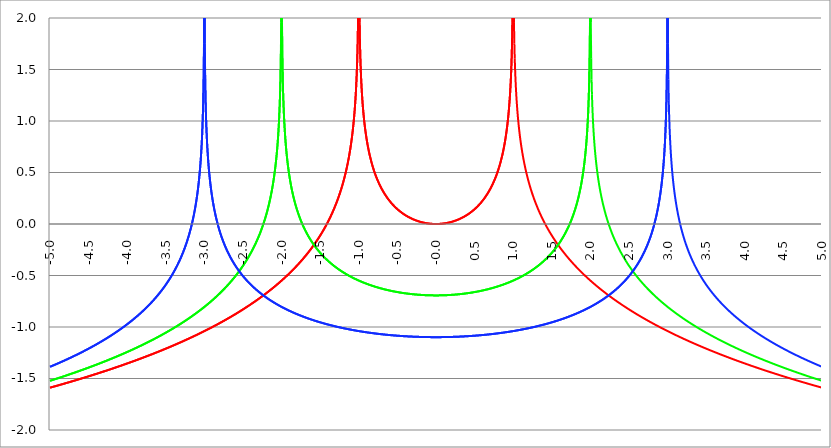
| Category | Series 1 | Series 0 | Series 2 |
|---|---|---|---|
| -5.0 | -1.589 | -1.522 | -1.386 |
| -4.995 | -1.588 | -1.521 | -1.385 |
| -4.99 | -1.587 | -1.52 | -1.383 |
| -4.985 | -1.586 | -1.519 | -1.382 |
| -4.98 | -1.585 | -1.517 | -1.38 |
| -4.975 | -1.584 | -1.516 | -1.378 |
| -4.97 | -1.583 | -1.515 | -1.377 |
| -4.965000000000001 | -1.582 | -1.514 | -1.375 |
| -4.960000000000001 | -1.581 | -1.513 | -1.374 |
| -4.955000000000001 | -1.58 | -1.511 | -1.372 |
| -4.950000000000001 | -1.579 | -1.51 | -1.371 |
| -4.945000000000001 | -1.577 | -1.509 | -1.369 |
| -4.940000000000001 | -1.576 | -1.508 | -1.367 |
| -4.935000000000001 | -1.575 | -1.507 | -1.366 |
| -4.930000000000001 | -1.574 | -1.505 | -1.364 |
| -4.925000000000002 | -1.573 | -1.504 | -1.362 |
| -4.920000000000002 | -1.572 | -1.503 | -1.361 |
| -4.915000000000002 | -1.571 | -1.502 | -1.359 |
| -4.910000000000002 | -1.57 | -1.501 | -1.358 |
| -4.905000000000002 | -1.569 | -1.499 | -1.356 |
| -4.900000000000002 | -1.568 | -1.498 | -1.354 |
| -4.895000000000002 | -1.567 | -1.497 | -1.353 |
| -4.890000000000002 | -1.566 | -1.496 | -1.351 |
| -4.885000000000002 | -1.565 | -1.494 | -1.349 |
| -4.880000000000002 | -1.564 | -1.493 | -1.348 |
| -4.875000000000003 | -1.563 | -1.492 | -1.346 |
| -4.870000000000003 | -1.562 | -1.491 | -1.344 |
| -4.865000000000003 | -1.56 | -1.49 | -1.343 |
| -4.860000000000003 | -1.559 | -1.488 | -1.341 |
| -4.855000000000003 | -1.558 | -1.487 | -1.34 |
| -4.850000000000003 | -1.557 | -1.486 | -1.338 |
| -4.845000000000003 | -1.556 | -1.485 | -1.336 |
| -4.840000000000003 | -1.555 | -1.483 | -1.335 |
| -4.835000000000003 | -1.554 | -1.482 | -1.333 |
| -4.830000000000004 | -1.553 | -1.481 | -1.331 |
| -4.825000000000004 | -1.552 | -1.48 | -1.329 |
| -4.820000000000004 | -1.551 | -1.478 | -1.328 |
| -4.815000000000004 | -1.55 | -1.477 | -1.326 |
| -4.810000000000004 | -1.549 | -1.476 | -1.324 |
| -4.805000000000004 | -1.548 | -1.475 | -1.323 |
| -4.800000000000004 | -1.546 | -1.473 | -1.321 |
| -4.795000000000004 | -1.545 | -1.472 | -1.319 |
| -4.790000000000004 | -1.544 | -1.471 | -1.318 |
| -4.785000000000004 | -1.543 | -1.469 | -1.316 |
| -4.780000000000004 | -1.542 | -1.468 | -1.314 |
| -4.775000000000004 | -1.541 | -1.467 | -1.312 |
| -4.770000000000004 | -1.54 | -1.466 | -1.311 |
| -4.765000000000005 | -1.539 | -1.464 | -1.309 |
| -4.760000000000005 | -1.538 | -1.463 | -1.307 |
| -4.755000000000005 | -1.537 | -1.462 | -1.305 |
| -4.750000000000005 | -1.535 | -1.461 | -1.304 |
| -4.745000000000005 | -1.534 | -1.459 | -1.302 |
| -4.740000000000005 | -1.533 | -1.458 | -1.3 |
| -4.735000000000005 | -1.532 | -1.457 | -1.298 |
| -4.730000000000005 | -1.531 | -1.455 | -1.297 |
| -4.725000000000006 | -1.53 | -1.454 | -1.295 |
| -4.720000000000006 | -1.529 | -1.453 | -1.293 |
| -4.715000000000006 | -1.528 | -1.452 | -1.291 |
| -4.710000000000006 | -1.527 | -1.45 | -1.29 |
| -4.705000000000006 | -1.526 | -1.449 | -1.288 |
| -4.700000000000006 | -1.524 | -1.448 | -1.286 |
| -4.695000000000006 | -1.523 | -1.446 | -1.284 |
| -4.690000000000006 | -1.522 | -1.445 | -1.282 |
| -4.685000000000007 | -1.521 | -1.444 | -1.281 |
| -4.680000000000007 | -1.52 | -1.442 | -1.279 |
| -4.675000000000007 | -1.519 | -1.441 | -1.277 |
| -4.670000000000007 | -1.518 | -1.44 | -1.275 |
| -4.665000000000007 | -1.517 | -1.439 | -1.273 |
| -4.660000000000007 | -1.515 | -1.437 | -1.271 |
| -4.655000000000007 | -1.514 | -1.436 | -1.27 |
| -4.650000000000007 | -1.513 | -1.435 | -1.268 |
| -4.645000000000007 | -1.512 | -1.433 | -1.266 |
| -4.640000000000008 | -1.511 | -1.432 | -1.264 |
| -4.635000000000008 | -1.51 | -1.431 | -1.262 |
| -4.630000000000008 | -1.509 | -1.429 | -1.26 |
| -4.625000000000008 | -1.508 | -1.428 | -1.258 |
| -4.620000000000008 | -1.506 | -1.427 | -1.257 |
| -4.615000000000008 | -1.505 | -1.425 | -1.255 |
| -4.610000000000008 | -1.504 | -1.424 | -1.253 |
| -4.605000000000008 | -1.503 | -1.423 | -1.251 |
| -4.600000000000008 | -1.502 | -1.421 | -1.249 |
| -4.595000000000009 | -1.501 | -1.42 | -1.247 |
| -4.590000000000009 | -1.5 | -1.419 | -1.245 |
| -4.585000000000009 | -1.498 | -1.417 | -1.243 |
| -4.580000000000009 | -1.497 | -1.416 | -1.241 |
| -4.57500000000001 | -1.496 | -1.415 | -1.24 |
| -4.57000000000001 | -1.495 | -1.413 | -1.238 |
| -4.565000000000009 | -1.494 | -1.412 | -1.236 |
| -4.560000000000009 | -1.493 | -1.41 | -1.234 |
| -4.555000000000009 | -1.492 | -1.409 | -1.232 |
| -4.55000000000001 | -1.49 | -1.408 | -1.23 |
| -4.54500000000001 | -1.489 | -1.406 | -1.228 |
| -4.54000000000001 | -1.488 | -1.405 | -1.226 |
| -4.53500000000001 | -1.487 | -1.404 | -1.224 |
| -4.53000000000001 | -1.486 | -1.402 | -1.222 |
| -4.52500000000001 | -1.485 | -1.401 | -1.22 |
| -4.52000000000001 | -1.483 | -1.4 | -1.218 |
| -4.51500000000001 | -1.482 | -1.398 | -1.216 |
| -4.51000000000001 | -1.481 | -1.397 | -1.214 |
| -4.505000000000011 | -1.48 | -1.395 | -1.212 |
| -4.500000000000011 | -1.479 | -1.394 | -1.21 |
| -4.495000000000011 | -1.478 | -1.393 | -1.208 |
| -4.490000000000011 | -1.476 | -1.391 | -1.206 |
| -4.485000000000011 | -1.475 | -1.39 | -1.204 |
| -4.480000000000011 | -1.474 | -1.388 | -1.202 |
| -4.475000000000011 | -1.473 | -1.387 | -1.2 |
| -4.470000000000011 | -1.472 | -1.386 | -1.198 |
| -4.465000000000011 | -1.471 | -1.384 | -1.196 |
| -4.460000000000011 | -1.469 | -1.383 | -1.194 |
| -4.455000000000012 | -1.468 | -1.381 | -1.192 |
| -4.450000000000012 | -1.467 | -1.38 | -1.19 |
| -4.445000000000012 | -1.466 | -1.379 | -1.188 |
| -4.440000000000012 | -1.465 | -1.377 | -1.186 |
| -4.435000000000012 | -1.463 | -1.376 | -1.184 |
| -4.430000000000012 | -1.462 | -1.374 | -1.182 |
| -4.425000000000012 | -1.461 | -1.373 | -1.18 |
| -4.420000000000012 | -1.46 | -1.372 | -1.177 |
| -4.415000000000012 | -1.459 | -1.37 | -1.175 |
| -4.410000000000013 | -1.457 | -1.369 | -1.173 |
| -4.405000000000013 | -1.456 | -1.367 | -1.171 |
| -4.400000000000013 | -1.455 | -1.366 | -1.169 |
| -4.395000000000013 | -1.454 | -1.364 | -1.167 |
| -4.390000000000013 | -1.453 | -1.363 | -1.165 |
| -4.385000000000013 | -1.451 | -1.362 | -1.163 |
| -4.380000000000013 | -1.45 | -1.36 | -1.16 |
| -4.375000000000013 | -1.449 | -1.359 | -1.158 |
| -4.370000000000013 | -1.448 | -1.357 | -1.156 |
| -4.365000000000013 | -1.447 | -1.356 | -1.154 |
| -4.360000000000014 | -1.445 | -1.354 | -1.152 |
| -4.355000000000014 | -1.444 | -1.353 | -1.15 |
| -4.350000000000014 | -1.443 | -1.351 | -1.147 |
| -4.345000000000014 | -1.442 | -1.35 | -1.145 |
| -4.340000000000014 | -1.441 | -1.349 | -1.143 |
| -4.335000000000014 | -1.439 | -1.347 | -1.141 |
| -4.330000000000014 | -1.438 | -1.346 | -1.139 |
| -4.325000000000014 | -1.437 | -1.344 | -1.136 |
| -4.320000000000014 | -1.436 | -1.343 | -1.134 |
| -4.315000000000015 | -1.434 | -1.341 | -1.132 |
| -4.310000000000015 | -1.433 | -1.34 | -1.13 |
| -4.305000000000015 | -1.432 | -1.338 | -1.127 |
| -4.300000000000015 | -1.431 | -1.337 | -1.125 |
| -4.295000000000015 | -1.43 | -1.335 | -1.123 |
| -4.290000000000015 | -1.428 | -1.334 | -1.121 |
| -4.285000000000015 | -1.427 | -1.332 | -1.118 |
| -4.280000000000015 | -1.426 | -1.331 | -1.116 |
| -4.275000000000015 | -1.425 | -1.329 | -1.114 |
| -4.270000000000015 | -1.423 | -1.328 | -1.111 |
| -4.265000000000016 | -1.422 | -1.326 | -1.109 |
| -4.260000000000016 | -1.421 | -1.325 | -1.107 |
| -4.255000000000016 | -1.42 | -1.323 | -1.104 |
| -4.250000000000016 | -1.418 | -1.322 | -1.102 |
| -4.245000000000016 | -1.417 | -1.32 | -1.1 |
| -4.240000000000016 | -1.416 | -1.319 | -1.097 |
| -4.235000000000016 | -1.415 | -1.317 | -1.095 |
| -4.230000000000016 | -1.413 | -1.316 | -1.093 |
| -4.225000000000017 | -1.412 | -1.314 | -1.09 |
| -4.220000000000017 | -1.411 | -1.313 | -1.088 |
| -4.215000000000017 | -1.41 | -1.311 | -1.085 |
| -4.210000000000017 | -1.408 | -1.31 | -1.083 |
| -4.205000000000017 | -1.407 | -1.308 | -1.081 |
| -4.200000000000017 | -1.406 | -1.307 | -1.078 |
| -4.195000000000017 | -1.405 | -1.305 | -1.076 |
| -4.190000000000017 | -1.403 | -1.303 | -1.073 |
| -4.185000000000017 | -1.402 | -1.302 | -1.071 |
| -4.180000000000017 | -1.401 | -1.3 | -1.068 |
| -4.175000000000018 | -1.4 | -1.299 | -1.066 |
| -4.170000000000018 | -1.398 | -1.297 | -1.063 |
| -4.165000000000018 | -1.397 | -1.296 | -1.061 |
| -4.160000000000018 | -1.396 | -1.294 | -1.058 |
| -4.155000000000018 | -1.394 | -1.293 | -1.056 |
| -4.150000000000018 | -1.393 | -1.291 | -1.053 |
| -4.145000000000018 | -1.392 | -1.289 | -1.051 |
| -4.140000000000018 | -1.391 | -1.288 | -1.048 |
| -4.135000000000018 | -1.389 | -1.286 | -1.046 |
| -4.130000000000019 | -1.388 | -1.285 | -1.043 |
| -4.125000000000019 | -1.387 | -1.283 | -1.041 |
| -4.120000000000019 | -1.385 | -1.281 | -1.038 |
| -4.115000000000019 | -1.384 | -1.28 | -1.036 |
| -4.110000000000019 | -1.383 | -1.278 | -1.033 |
| -4.105000000000019 | -1.382 | -1.277 | -1.03 |
| -4.100000000000019 | -1.38 | -1.275 | -1.028 |
| -4.095000000000019 | -1.379 | -1.274 | -1.025 |
| -4.090000000000019 | -1.378 | -1.272 | -1.022 |
| -4.085000000000019 | -1.376 | -1.27 | -1.02 |
| -4.08000000000002 | -1.375 | -1.269 | -1.017 |
| -4.07500000000002 | -1.374 | -1.267 | -1.014 |
| -4.07000000000002 | -1.373 | -1.265 | -1.012 |
| -4.06500000000002 | -1.371 | -1.264 | -1.009 |
| -4.06000000000002 | -1.37 | -1.262 | -1.006 |
| -4.05500000000002 | -1.369 | -1.261 | -1.004 |
| -4.05000000000002 | -1.367 | -1.259 | -1.001 |
| -4.04500000000002 | -1.366 | -1.257 | -0.998 |
| -4.04000000000002 | -1.365 | -1.256 | -0.995 |
| -4.03500000000002 | -1.363 | -1.254 | -0.993 |
| -4.03000000000002 | -1.362 | -1.252 | -0.99 |
| -4.025000000000021 | -1.361 | -1.251 | -0.987 |
| -4.020000000000021 | -1.359 | -1.249 | -0.984 |
| -4.015000000000021 | -1.358 | -1.247 | -0.981 |
| -4.010000000000021 | -1.357 | -1.246 | -0.979 |
| -4.005000000000021 | -1.355 | -1.244 | -0.976 |
| -4.000000000000021 | -1.354 | -1.242 | -0.973 |
| -3.995000000000021 | -1.353 | -1.241 | -0.97 |
| -3.990000000000021 | -1.351 | -1.239 | -0.967 |
| -3.985000000000022 | -1.35 | -1.237 | -0.964 |
| -3.980000000000022 | -1.349 | -1.236 | -0.961 |
| -3.975000000000022 | -1.347 | -1.234 | -0.959 |
| -3.970000000000022 | -1.346 | -1.232 | -0.956 |
| -3.965000000000022 | -1.345 | -1.231 | -0.953 |
| -3.960000000000022 | -1.343 | -1.229 | -0.95 |
| -3.955000000000022 | -1.342 | -1.227 | -0.947 |
| -3.950000000000022 | -1.341 | -1.226 | -0.944 |
| -3.945000000000022 | -1.339 | -1.224 | -0.941 |
| -3.940000000000023 | -1.338 | -1.222 | -0.938 |
| -3.935000000000023 | -1.337 | -1.22 | -0.935 |
| -3.930000000000023 | -1.335 | -1.219 | -0.932 |
| -3.925000000000023 | -1.334 | -1.217 | -0.929 |
| -3.920000000000023 | -1.332 | -1.215 | -0.926 |
| -3.915000000000023 | -1.331 | -1.214 | -0.922 |
| -3.910000000000023 | -1.33 | -1.212 | -0.919 |
| -3.905000000000023 | -1.328 | -1.21 | -0.916 |
| -3.900000000000023 | -1.327 | -1.208 | -0.913 |
| -3.895000000000023 | -1.326 | -1.207 | -0.91 |
| -3.890000000000024 | -1.324 | -1.205 | -0.907 |
| -3.885000000000024 | -1.323 | -1.203 | -0.904 |
| -3.880000000000024 | -1.321 | -1.201 | -0.9 |
| -3.875000000000024 | -1.32 | -1.2 | -0.897 |
| -3.870000000000024 | -1.319 | -1.198 | -0.894 |
| -3.865000000000024 | -1.317 | -1.196 | -0.891 |
| -3.860000000000024 | -1.316 | -1.194 | -0.887 |
| -3.855000000000024 | -1.315 | -1.193 | -0.884 |
| -3.850000000000024 | -1.313 | -1.191 | -0.881 |
| -3.845000000000025 | -1.312 | -1.189 | -0.878 |
| -3.840000000000025 | -1.31 | -1.187 | -0.874 |
| -3.835000000000025 | -1.309 | -1.185 | -0.871 |
| -3.830000000000025 | -1.308 | -1.184 | -0.867 |
| -3.825000000000025 | -1.306 | -1.182 | -0.864 |
| -3.820000000000025 | -1.305 | -1.18 | -0.861 |
| -3.815000000000025 | -1.303 | -1.178 | -0.857 |
| -3.810000000000025 | -1.302 | -1.176 | -0.854 |
| -3.805000000000025 | -1.301 | -1.175 | -0.85 |
| -3.800000000000026 | -1.299 | -1.173 | -0.847 |
| -3.795000000000026 | -1.298 | -1.171 | -0.843 |
| -3.790000000000026 | -1.296 | -1.169 | -0.84 |
| -3.785000000000026 | -1.295 | -1.167 | -0.836 |
| -3.780000000000026 | -1.293 | -1.166 | -0.833 |
| -3.775000000000026 | -1.292 | -1.164 | -0.829 |
| -3.770000000000026 | -1.291 | -1.162 | -0.826 |
| -3.765000000000026 | -1.289 | -1.16 | -0.822 |
| -3.760000000000026 | -1.288 | -1.158 | -0.818 |
| -3.755000000000026 | -1.286 | -1.156 | -0.815 |
| -3.750000000000027 | -1.285 | -1.154 | -0.811 |
| -3.745000000000027 | -1.283 | -1.153 | -0.807 |
| -3.740000000000027 | -1.282 | -1.151 | -0.803 |
| -3.735000000000027 | -1.281 | -1.149 | -0.8 |
| -3.730000000000027 | -1.279 | -1.147 | -0.796 |
| -3.725000000000027 | -1.278 | -1.145 | -0.792 |
| -3.720000000000027 | -1.276 | -1.143 | -0.788 |
| -3.715000000000027 | -1.275 | -1.141 | -0.784 |
| -3.710000000000027 | -1.273 | -1.139 | -0.781 |
| -3.705000000000028 | -1.272 | -1.137 | -0.777 |
| -3.700000000000028 | -1.27 | -1.136 | -0.773 |
| -3.695000000000028 | -1.269 | -1.134 | -0.769 |
| -3.690000000000028 | -1.267 | -1.132 | -0.765 |
| -3.685000000000028 | -1.266 | -1.13 | -0.761 |
| -3.680000000000028 | -1.265 | -1.128 | -0.757 |
| -3.675000000000028 | -1.263 | -1.126 | -0.753 |
| -3.670000000000028 | -1.262 | -1.124 | -0.749 |
| -3.665000000000028 | -1.26 | -1.122 | -0.744 |
| -3.660000000000028 | -1.259 | -1.12 | -0.74 |
| -3.655000000000029 | -1.257 | -1.118 | -0.736 |
| -3.650000000000029 | -1.256 | -1.116 | -0.732 |
| -3.645000000000029 | -1.254 | -1.114 | -0.728 |
| -3.640000000000029 | -1.253 | -1.112 | -0.723 |
| -3.635000000000029 | -1.251 | -1.11 | -0.719 |
| -3.630000000000029 | -1.25 | -1.108 | -0.715 |
| -3.625000000000029 | -1.248 | -1.106 | -0.71 |
| -3.620000000000029 | -1.247 | -1.104 | -0.706 |
| -3.615000000000029 | -1.245 | -1.102 | -0.702 |
| -3.61000000000003 | -1.244 | -1.1 | -0.697 |
| -3.60500000000003 | -1.242 | -1.098 | -0.693 |
| -3.60000000000003 | -1.241 | -1.096 | -0.688 |
| -3.59500000000003 | -1.239 | -1.094 | -0.684 |
| -3.59000000000003 | -1.238 | -1.092 | -0.679 |
| -3.58500000000003 | -1.236 | -1.09 | -0.674 |
| -3.58000000000003 | -1.235 | -1.088 | -0.67 |
| -3.57500000000003 | -1.233 | -1.086 | -0.665 |
| -3.57000000000003 | -1.232 | -1.084 | -0.66 |
| -3.565000000000031 | -1.23 | -1.082 | -0.655 |
| -3.560000000000031 | -1.229 | -1.08 | -0.651 |
| -3.555000000000031 | -1.227 | -1.078 | -0.646 |
| -3.550000000000031 | -1.226 | -1.076 | -0.641 |
| -3.545000000000031 | -1.224 | -1.074 | -0.636 |
| -3.540000000000031 | -1.223 | -1.072 | -0.631 |
| -3.535000000000031 | -1.221 | -1.07 | -0.626 |
| -3.530000000000031 | -1.219 | -1.068 | -0.621 |
| -3.525000000000031 | -1.218 | -1.066 | -0.616 |
| -3.520000000000032 | -1.216 | -1.064 | -0.61 |
| -3.515000000000032 | -1.215 | -1.061 | -0.605 |
| -3.510000000000032 | -1.213 | -1.059 | -0.6 |
| -3.505000000000032 | -1.212 | -1.057 | -0.595 |
| -3.500000000000032 | -1.21 | -1.055 | -0.589 |
| -3.495000000000032 | -1.209 | -1.053 | -0.584 |
| -3.490000000000032 | -1.207 | -1.051 | -0.578 |
| -3.485000000000032 | -1.206 | -1.049 | -0.573 |
| -3.480000000000032 | -1.204 | -1.047 | -0.567 |
| -3.475000000000032 | -1.202 | -1.044 | -0.562 |
| -3.470000000000033 | -1.201 | -1.042 | -0.556 |
| -3.465000000000033 | -1.199 | -1.04 | -0.55 |
| -3.460000000000033 | -1.198 | -1.038 | -0.545 |
| -3.455000000000033 | -1.196 | -1.036 | -0.539 |
| -3.450000000000033 | -1.194 | -1.034 | -0.533 |
| -3.445000000000033 | -1.193 | -1.031 | -0.527 |
| -3.440000000000033 | -1.191 | -1.029 | -0.521 |
| -3.435000000000033 | -1.19 | -1.027 | -0.515 |
| -3.430000000000033 | -1.188 | -1.025 | -0.509 |
| -3.425000000000034 | -1.187 | -1.023 | -0.502 |
| -3.420000000000034 | -1.185 | -1.02 | -0.496 |
| -3.415000000000034 | -1.183 | -1.018 | -0.49 |
| -3.410000000000034 | -1.182 | -1.016 | -0.483 |
| -3.405000000000034 | -1.18 | -1.014 | -0.477 |
| -3.400000000000034 | -1.179 | -1.011 | -0.47 |
| -3.395000000000034 | -1.177 | -1.009 | -0.463 |
| -3.390000000000034 | -1.175 | -1.007 | -0.457 |
| -3.385000000000034 | -1.174 | -1.005 | -0.45 |
| -3.380000000000034 | -1.172 | -1.002 | -0.443 |
| -3.375000000000035 | -1.17 | -1 | -0.436 |
| -3.370000000000035 | -1.169 | -0.998 | -0.429 |
| -3.365000000000035 | -1.167 | -0.996 | -0.421 |
| -3.360000000000035 | -1.166 | -0.993 | -0.414 |
| -3.355000000000035 | -1.164 | -0.991 | -0.407 |
| -3.350000000000035 | -1.162 | -0.989 | -0.399 |
| -3.345000000000035 | -1.161 | -0.986 | -0.392 |
| -3.340000000000035 | -1.159 | -0.984 | -0.384 |
| -3.335000000000035 | -1.157 | -0.982 | -0.376 |
| -3.330000000000036 | -1.156 | -0.979 | -0.368 |
| -3.325000000000036 | -1.154 | -0.977 | -0.36 |
| -3.320000000000036 | -1.152 | -0.975 | -0.352 |
| -3.315000000000036 | -1.151 | -0.972 | -0.344 |
| -3.310000000000036 | -1.149 | -0.97 | -0.335 |
| -3.305000000000036 | -1.147 | -0.967 | -0.327 |
| -3.300000000000036 | -1.146 | -0.965 | -0.318 |
| -3.295000000000036 | -1.144 | -0.963 | -0.309 |
| -3.290000000000036 | -1.142 | -0.96 | -0.301 |
| -3.285000000000036 | -1.141 | -0.958 | -0.291 |
| -3.280000000000036 | -1.139 | -0.955 | -0.282 |
| -3.275000000000037 | -1.137 | -0.953 | -0.273 |
| -3.270000000000037 | -1.136 | -0.951 | -0.263 |
| -3.265000000000037 | -1.134 | -0.948 | -0.253 |
| -3.260000000000037 | -1.132 | -0.946 | -0.244 |
| -3.255000000000037 | -1.131 | -0.943 | -0.233 |
| -3.250000000000037 | -1.129 | -0.941 | -0.223 |
| -3.245000000000037 | -1.127 | -0.938 | -0.213 |
| -3.240000000000037 | -1.126 | -0.936 | -0.202 |
| -3.235000000000038 | -1.124 | -0.933 | -0.191 |
| -3.230000000000038 | -1.122 | -0.931 | -0.18 |
| -3.225000000000038 | -1.12 | -0.928 | -0.168 |
| -3.220000000000038 | -1.119 | -0.926 | -0.157 |
| -3.215000000000038 | -1.117 | -0.923 | -0.145 |
| -3.210000000000038 | -1.115 | -0.921 | -0.133 |
| -3.205000000000038 | -1.114 | -0.918 | -0.12 |
| -3.200000000000038 | -1.112 | -0.915 | -0.108 |
| -3.195000000000038 | -1.11 | -0.913 | -0.094 |
| -3.190000000000039 | -1.108 | -0.91 | -0.081 |
| -3.185000000000039 | -1.107 | -0.908 | -0.067 |
| -3.180000000000039 | -1.105 | -0.905 | -0.053 |
| -3.175000000000039 | -1.103 | -0.903 | -0.039 |
| -3.170000000000039 | -1.101 | -0.9 | -0.024 |
| -3.16500000000004 | -1.1 | -0.897 | -0.009 |
| -3.16000000000004 | -1.098 | -0.895 | 0.007 |
| -3.155000000000039 | -1.096 | -0.892 | 0.024 |
| -3.150000000000039 | -1.094 | -0.889 | 0.04 |
| -3.14500000000004 | -1.093 | -0.887 | 0.058 |
| -3.14000000000004 | -1.091 | -0.884 | 0.076 |
| -3.13500000000004 | -1.089 | -0.881 | 0.094 |
| -3.13000000000004 | -1.087 | -0.879 | 0.114 |
| -3.12500000000004 | -1.085 | -0.876 | 0.134 |
| -3.12000000000004 | -1.084 | -0.873 | 0.154 |
| -3.11500000000004 | -1.082 | -0.871 | 0.176 |
| -3.11000000000004 | -1.08 | -0.868 | 0.199 |
| -3.10500000000004 | -1.078 | -0.865 | 0.222 |
| -3.10000000000004 | -1.076 | -0.862 | 0.247 |
| -3.095000000000041 | -1.075 | -0.86 | 0.273 |
| -3.090000000000041 | -1.073 | -0.857 | 0.301 |
| -3.085000000000041 | -1.071 | -0.854 | 0.33 |
| -3.080000000000041 | -1.069 | -0.851 | 0.36 |
| -3.075000000000041 | -1.067 | -0.848 | 0.393 |
| -3.070000000000041 | -1.066 | -0.845 | 0.428 |
| -3.065000000000041 | -1.064 | -0.843 | 0.465 |
| -3.060000000000041 | -1.062 | -0.84 | 0.506 |
| -3.055000000000041 | -1.06 | -0.837 | 0.55 |
| -3.050000000000042 | -1.058 | -0.834 | 0.598 |
| -3.045000000000042 | -1.056 | -0.831 | 0.651 |
| -3.040000000000042 | -1.055 | -0.828 | 0.71 |
| -3.035000000000042 | -1.053 | -0.825 | 0.777 |
| -3.030000000000042 | -1.051 | -0.822 | 0.855 |
| -3.025000000000042 | -1.049 | -0.82 | 0.946 |
| -3.020000000000042 | -1.047 | -0.817 | 1.058 |
| -3.015000000000042 | -1.045 | -0.814 | 1.203 |
| -3.010000000000042 | -1.043 | -0.811 | 1.406 |
| -3.005000000000043 | -1.042 | -0.808 | 1.753 |
| -3.000000000000043 | -1.04 | -0.805 | 14.497 |
| -2.995000000000043 | -1.038 | -0.802 | 1.754 |
| -2.990000000000043 | -1.036 | -0.799 | 1.408 |
| -2.985000000000043 | -1.034 | -0.796 | 1.205 |
| -2.980000000000043 | -1.032 | -0.793 | 1.062 |
| -2.975000000000043 | -1.03 | -0.79 | 0.951 |
| -2.970000000000043 | -1.028 | -0.786 | 0.86 |
| -2.965000000000043 | -1.026 | -0.783 | 0.783 |
| -2.960000000000043 | -1.025 | -0.78 | 0.717 |
| -2.955000000000044 | -1.023 | -0.777 | 0.658 |
| -2.950000000000044 | -1.021 | -0.774 | 0.606 |
| -2.945000000000044 | -1.019 | -0.771 | 0.559 |
| -2.940000000000044 | -1.017 | -0.768 | 0.516 |
| -2.935000000000044 | -1.015 | -0.765 | 0.476 |
| -2.930000000000044 | -1.013 | -0.761 | 0.44 |
| -2.925000000000044 | -1.011 | -0.758 | 0.406 |
| -2.920000000000044 | -1.009 | -0.755 | 0.374 |
| -2.915000000000044 | -1.007 | -0.752 | 0.344 |
| -2.910000000000045 | -1.005 | -0.748 | 0.316 |
| -2.905000000000045 | -1.003 | -0.745 | 0.289 |
| -2.900000000000045 | -1.001 | -0.742 | 0.264 |
| -2.895000000000045 | -0.999 | -0.739 | 0.24 |
| -2.890000000000045 | -0.997 | -0.735 | 0.217 |
| -2.885000000000045 | -0.996 | -0.732 | 0.195 |
| -2.880000000000045 | -0.994 | -0.729 | 0.174 |
| -2.875000000000045 | -0.992 | -0.725 | 0.154 |
| -2.870000000000045 | -0.99 | -0.722 | 0.135 |
| -2.865000000000045 | -0.988 | -0.719 | 0.117 |
| -2.860000000000046 | -0.986 | -0.715 | 0.099 |
| -2.855000000000046 | -0.984 | -0.712 | 0.082 |
| -2.850000000000046 | -0.982 | -0.708 | 0.065 |
| -2.845000000000046 | -0.98 | -0.705 | 0.049 |
| -2.840000000000046 | -0.978 | -0.701 | 0.034 |
| -2.835000000000046 | -0.976 | -0.698 | 0.019 |
| -2.830000000000046 | -0.974 | -0.694 | 0.004 |
| -2.825000000000046 | -0.972 | -0.691 | -0.01 |
| -2.820000000000046 | -0.97 | -0.687 | -0.023 |
| -2.815000000000047 | -0.968 | -0.684 | -0.037 |
| -2.810000000000047 | -0.965 | -0.68 | -0.049 |
| -2.805000000000047 | -0.963 | -0.676 | -0.062 |
| -2.800000000000047 | -0.961 | -0.673 | -0.074 |
| -2.795000000000047 | -0.959 | -0.669 | -0.086 |
| -2.790000000000047 | -0.957 | -0.665 | -0.098 |
| -2.785000000000047 | -0.955 | -0.662 | -0.109 |
| -2.780000000000047 | -0.953 | -0.658 | -0.12 |
| -2.775000000000047 | -0.951 | -0.654 | -0.131 |
| -2.770000000000047 | -0.949 | -0.65 | -0.141 |
| -2.765000000000048 | -0.947 | -0.647 | -0.152 |
| -2.760000000000048 | -0.945 | -0.643 | -0.162 |
| -2.755000000000048 | -0.943 | -0.639 | -0.172 |
| -2.750000000000048 | -0.941 | -0.635 | -0.181 |
| -2.745000000000048 | -0.939 | -0.631 | -0.191 |
| -2.740000000000048 | -0.936 | -0.627 | -0.2 |
| -2.735000000000048 | -0.934 | -0.624 | -0.209 |
| -2.730000000000048 | -0.932 | -0.62 | -0.218 |
| -2.725000000000048 | -0.93 | -0.616 | -0.227 |
| -2.720000000000049 | -0.928 | -0.612 | -0.236 |
| -2.715000000000049 | -0.926 | -0.608 | -0.244 |
| -2.710000000000049 | -0.924 | -0.604 | -0.252 |
| -2.705000000000049 | -0.922 | -0.6 | -0.26 |
| -2.700000000000049 | -0.919 | -0.595 | -0.268 |
| -2.695000000000049 | -0.917 | -0.591 | -0.276 |
| -2.690000000000049 | -0.915 | -0.587 | -0.284 |
| -2.685000000000049 | -0.913 | -0.583 | -0.291 |
| -2.680000000000049 | -0.911 | -0.579 | -0.299 |
| -2.675000000000049 | -0.909 | -0.575 | -0.306 |
| -2.67000000000005 | -0.907 | -0.57 | -0.313 |
| -2.66500000000005 | -0.904 | -0.566 | -0.32 |
| -2.66000000000005 | -0.902 | -0.562 | -0.327 |
| -2.65500000000005 | -0.9 | -0.557 | -0.334 |
| -2.65000000000005 | -0.898 | -0.553 | -0.341 |
| -2.64500000000005 | -0.896 | -0.549 | -0.348 |
| -2.64000000000005 | -0.893 | -0.544 | -0.354 |
| -2.63500000000005 | -0.891 | -0.54 | -0.361 |
| -2.63000000000005 | -0.889 | -0.535 | -0.367 |
| -2.625000000000051 | -0.887 | -0.531 | -0.373 |
| -2.620000000000051 | -0.884 | -0.526 | -0.379 |
| -2.615000000000051 | -0.882 | -0.522 | -0.385 |
| -2.610000000000051 | -0.88 | -0.517 | -0.391 |
| -2.605000000000051 | -0.878 | -0.512 | -0.397 |
| -2.600000000000051 | -0.875 | -0.508 | -0.403 |
| -2.595000000000051 | -0.873 | -0.503 | -0.409 |
| -2.590000000000051 | -0.871 | -0.498 | -0.415 |
| -2.585000000000051 | -0.869 | -0.493 | -0.42 |
| -2.580000000000052 | -0.866 | -0.488 | -0.426 |
| -2.575000000000052 | -0.864 | -0.484 | -0.431 |
| -2.570000000000052 | -0.862 | -0.479 | -0.437 |
| -2.565000000000052 | -0.86 | -0.474 | -0.442 |
| -2.560000000000052 | -0.857 | -0.469 | -0.447 |
| -2.555000000000052 | -0.855 | -0.464 | -0.453 |
| -2.550000000000052 | -0.853 | -0.459 | -0.458 |
| -2.545000000000052 | -0.85 | -0.454 | -0.463 |
| -2.540000000000052 | -0.848 | -0.448 | -0.468 |
| -2.535000000000053 | -0.846 | -0.443 | -0.473 |
| -2.530000000000053 | -0.843 | -0.438 | -0.478 |
| -2.525000000000053 | -0.841 | -0.433 | -0.482 |
| -2.520000000000053 | -0.839 | -0.427 | -0.487 |
| -2.515000000000053 | -0.836 | -0.422 | -0.492 |
| -2.510000000000053 | -0.834 | -0.416 | -0.497 |
| -2.505000000000053 | -0.831 | -0.411 | -0.501 |
| -2.500000000000053 | -0.829 | -0.405 | -0.506 |
| -2.495000000000053 | -0.827 | -0.4 | -0.51 |
| -2.490000000000053 | -0.824 | -0.394 | -0.515 |
| -2.485000000000054 | -0.822 | -0.389 | -0.519 |
| -2.480000000000054 | -0.82 | -0.383 | -0.524 |
| -2.475000000000054 | -0.817 | -0.377 | -0.528 |
| -2.470000000000054 | -0.815 | -0.371 | -0.532 |
| -2.465000000000054 | -0.812 | -0.365 | -0.536 |
| -2.460000000000054 | -0.81 | -0.359 | -0.541 |
| -2.455000000000054 | -0.807 | -0.353 | -0.545 |
| -2.450000000000054 | -0.805 | -0.347 | -0.549 |
| -2.445000000000054 | -0.803 | -0.341 | -0.553 |
| -2.440000000000055 | -0.8 | -0.335 | -0.557 |
| -2.435000000000055 | -0.798 | -0.329 | -0.561 |
| -2.430000000000055 | -0.795 | -0.322 | -0.565 |
| -2.425000000000055 | -0.793 | -0.316 | -0.569 |
| -2.420000000000055 | -0.79 | -0.309 | -0.573 |
| -2.415000000000055 | -0.788 | -0.303 | -0.577 |
| -2.410000000000055 | -0.785 | -0.296 | -0.58 |
| -2.405000000000055 | -0.783 | -0.289 | -0.584 |
| -2.400000000000055 | -0.78 | -0.283 | -0.588 |
| -2.395000000000055 | -0.778 | -0.276 | -0.591 |
| -2.390000000000056 | -0.775 | -0.269 | -0.595 |
| -2.385000000000056 | -0.773 | -0.262 | -0.599 |
| -2.380000000000056 | -0.77 | -0.255 | -0.602 |
| -2.375000000000056 | -0.767 | -0.248 | -0.606 |
| -2.370000000000056 | -0.765 | -0.24 | -0.609 |
| -2.365000000000056 | -0.762 | -0.233 | -0.613 |
| -2.360000000000056 | -0.76 | -0.225 | -0.616 |
| -2.355000000000056 | -0.757 | -0.218 | -0.62 |
| -2.350000000000056 | -0.755 | -0.21 | -0.623 |
| -2.345000000000057 | -0.752 | -0.202 | -0.627 |
| -2.340000000000057 | -0.749 | -0.195 | -0.63 |
| -2.335000000000057 | -0.747 | -0.187 | -0.633 |
| -2.330000000000057 | -0.744 | -0.178 | -0.636 |
| -2.325000000000057 | -0.741 | -0.17 | -0.64 |
| -2.320000000000057 | -0.739 | -0.162 | -0.643 |
| -2.315000000000057 | -0.736 | -0.153 | -0.646 |
| -2.310000000000057 | -0.733 | -0.145 | -0.649 |
| -2.305000000000057 | -0.731 | -0.136 | -0.652 |
| -2.300000000000058 | -0.728 | -0.127 | -0.656 |
| -2.295000000000058 | -0.725 | -0.118 | -0.659 |
| -2.290000000000058 | -0.723 | -0.109 | -0.662 |
| -2.285000000000058 | -0.72 | -0.1 | -0.665 |
| -2.280000000000058 | -0.717 | -0.09 | -0.668 |
| -2.275000000000058 | -0.715 | -0.081 | -0.671 |
| -2.270000000000058 | -0.712 | -0.071 | -0.674 |
| -2.265000000000058 | -0.709 | -0.061 | -0.677 |
| -2.260000000000058 | -0.706 | -0.051 | -0.68 |
| -2.255000000000058 | -0.704 | -0.041 | -0.682 |
| -2.250000000000059 | -0.701 | -0.03 | -0.685 |
| -2.245000000000059 | -0.698 | -0.02 | -0.688 |
| -2.240000000000059 | -0.695 | -0.009 | -0.691 |
| -2.235000000000059 | -0.693 | 0.002 | -0.694 |
| -2.23000000000006 | -0.69 | 0.014 | -0.697 |
| -2.22500000000006 | -0.687 | 0.025 | -0.699 |
| -2.22000000000006 | -0.684 | 0.037 | -0.702 |
| -2.215000000000059 | -0.681 | 0.049 | -0.705 |
| -2.210000000000059 | -0.678 | 0.062 | -0.707 |
| -2.20500000000006 | -0.676 | 0.074 | -0.71 |
| -2.20000000000006 | -0.673 | 0.087 | -0.713 |
| -2.19500000000006 | -0.67 | 0.1 | -0.715 |
| -2.19000000000006 | -0.667 | 0.114 | -0.718 |
| -2.18500000000006 | -0.664 | 0.128 | -0.721 |
| -2.18000000000006 | -0.661 | 0.142 | -0.723 |
| -2.17500000000006 | -0.658 | 0.157 | -0.726 |
| -2.17000000000006 | -0.655 | 0.172 | -0.728 |
| -2.16500000000006 | -0.652 | 0.188 | -0.731 |
| -2.160000000000061 | -0.649 | 0.204 | -0.733 |
| -2.155000000000061 | -0.647 | 0.22 | -0.736 |
| -2.150000000000061 | -0.644 | 0.237 | -0.738 |
| -2.145000000000061 | -0.641 | 0.255 | -0.741 |
| -2.140000000000061 | -0.638 | 0.273 | -0.743 |
| -2.135000000000061 | -0.635 | 0.291 | -0.746 |
| -2.130000000000061 | -0.632 | 0.311 | -0.748 |
| -2.125000000000061 | -0.629 | 0.331 | -0.75 |
| -2.120000000000061 | -0.626 | 0.352 | -0.753 |
| -2.115000000000061 | -0.623 | 0.374 | -0.755 |
| -2.110000000000062 | -0.619 | 0.397 | -0.757 |
| -2.105000000000062 | -0.616 | 0.421 | -0.76 |
| -2.100000000000062 | -0.613 | 0.446 | -0.762 |
| -2.095000000000062 | -0.61 | 0.472 | -0.764 |
| -2.090000000000062 | -0.607 | 0.5 | -0.766 |
| -2.085000000000062 | -0.604 | 0.529 | -0.769 |
| -2.080000000000062 | -0.601 | 0.56 | -0.771 |
| -2.075000000000062 | -0.598 | 0.593 | -0.773 |
| -2.070000000000062 | -0.595 | 0.628 | -0.775 |
| -2.065000000000063 | -0.592 | 0.665 | -0.778 |
| -2.060000000000063 | -0.588 | 0.706 | -0.78 |
| -2.055000000000063 | -0.585 | 0.75 | -0.782 |
| -2.050000000000063 | -0.582 | 0.799 | -0.784 |
| -2.045000000000063 | -0.579 | 0.852 | -0.786 |
| -2.040000000000063 | -0.576 | 0.911 | -0.788 |
| -2.035000000000063 | -0.572 | 0.979 | -0.79 |
| -2.030000000000063 | -0.569 | 1.056 | -0.792 |
| -2.025000000000063 | -0.566 | 1.148 | -0.795 |
| -2.020000000000064 | -0.563 | 1.26 | -0.797 |
| -2.015000000000064 | -0.559 | 1.405 | -0.799 |
| -2.010000000000064 | -0.556 | 1.608 | -0.801 |
| -2.005000000000064 | -0.553 | 1.955 | -0.803 |
| -2.000000000000064 | -0.549 | 14.497 | -0.805 |
| -1.995000000000064 | -0.546 | 1.957 | -0.807 |
| -1.990000000000064 | -0.543 | 1.611 | -0.809 |
| -1.985000000000064 | -0.539 | 1.409 | -0.811 |
| -1.980000000000064 | -0.536 | 1.265 | -0.813 |
| -1.975000000000064 | -0.532 | 1.154 | -0.815 |
| -1.970000000000065 | -0.529 | 1.064 | -0.816 |
| -1.965000000000065 | -0.526 | 0.987 | -0.818 |
| -1.960000000000065 | -0.522 | 0.921 | -0.82 |
| -1.955000000000065 | -0.519 | 0.863 | -0.822 |
| -1.950000000000065 | -0.515 | 0.811 | -0.824 |
| -1.945000000000065 | -0.512 | 0.764 | -0.826 |
| -1.940000000000065 | -0.508 | 0.721 | -0.828 |
| -1.935000000000065 | -0.505 | 0.682 | -0.83 |
| -1.930000000000065 | -0.501 | 0.645 | -0.831 |
| -1.925000000000066 | -0.498 | 0.611 | -0.833 |
| -1.920000000000066 | -0.494 | 0.58 | -0.835 |
| -1.915000000000066 | -0.491 | 0.55 | -0.837 |
| -1.910000000000066 | -0.487 | 0.522 | -0.839 |
| -1.905000000000066 | -0.483 | 0.496 | -0.841 |
| -1.900000000000066 | -0.48 | 0.471 | -0.842 |
| -1.895000000000066 | -0.476 | 0.447 | -0.844 |
| -1.890000000000066 | -0.472 | 0.424 | -0.846 |
| -1.885000000000066 | -0.469 | 0.403 | -0.848 |
| -1.880000000000066 | -0.465 | 0.382 | -0.849 |
| -1.875000000000067 | -0.461 | 0.362 | -0.851 |
| -1.870000000000067 | -0.458 | 0.343 | -0.853 |
| -1.865000000000067 | -0.454 | 0.325 | -0.854 |
| -1.860000000000067 | -0.45 | 0.308 | -0.856 |
| -1.855000000000067 | -0.446 | 0.291 | -0.858 |
| -1.850000000000067 | -0.442 | 0.275 | -0.859 |
| -1.845000000000067 | -0.439 | 0.259 | -0.861 |
| -1.840000000000067 | -0.435 | 0.244 | -0.863 |
| -1.835000000000067 | -0.431 | 0.229 | -0.864 |
| -1.830000000000068 | -0.427 | 0.215 | -0.866 |
| -1.825000000000068 | -0.423 | 0.201 | -0.868 |
| -1.820000000000068 | -0.419 | 0.187 | -0.869 |
| -1.815000000000068 | -0.415 | 0.174 | -0.871 |
| -1.810000000000068 | -0.411 | 0.162 | -0.872 |
| -1.805000000000068 | -0.407 | 0.149 | -0.874 |
| -1.800000000000068 | -0.403 | 0.137 | -0.875 |
| -1.795000000000068 | -0.399 | 0.126 | -0.877 |
| -1.790000000000068 | -0.395 | 0.114 | -0.879 |
| -1.785000000000068 | -0.391 | 0.103 | -0.88 |
| -1.780000000000069 | -0.387 | 0.092 | -0.882 |
| -1.775000000000069 | -0.383 | 0.082 | -0.883 |
| -1.770000000000069 | -0.379 | 0.071 | -0.885 |
| -1.765000000000069 | -0.375 | 0.061 | -0.886 |
| -1.760000000000069 | -0.37 | 0.051 | -0.888 |
| -1.75500000000007 | -0.366 | 0.042 | -0.889 |
| -1.75000000000007 | -0.362 | 0.032 | -0.891 |
| -1.745000000000069 | -0.358 | 0.023 | -0.892 |
| -1.740000000000069 | -0.353 | 0.014 | -0.894 |
| -1.73500000000007 | -0.349 | 0.005 | -0.895 |
| -1.73000000000007 | -0.345 | -0.004 | -0.896 |
| -1.72500000000007 | -0.34 | -0.012 | -0.898 |
| -1.72000000000007 | -0.336 | -0.02 | -0.899 |
| -1.71500000000007 | -0.332 | -0.029 | -0.901 |
| -1.71000000000007 | -0.327 | -0.037 | -0.902 |
| -1.70500000000007 | -0.323 | -0.044 | -0.904 |
| -1.70000000000007 | -0.318 | -0.052 | -0.905 |
| -1.69500000000007 | -0.314 | -0.06 | -0.906 |
| -1.69000000000007 | -0.309 | -0.067 | -0.908 |
| -1.685000000000071 | -0.305 | -0.075 | -0.909 |
| -1.680000000000071 | -0.3 | -0.082 | -0.91 |
| -1.675000000000071 | -0.295 | -0.089 | -0.912 |
| -1.670000000000071 | -0.291 | -0.096 | -0.913 |
| -1.665000000000071 | -0.286 | -0.103 | -0.915 |
| -1.660000000000071 | -0.281 | -0.109 | -0.916 |
| -1.655000000000071 | -0.277 | -0.116 | -0.917 |
| -1.650000000000071 | -0.272 | -0.122 | -0.918 |
| -1.645000000000071 | -0.267 | -0.129 | -0.92 |
| -1.640000000000072 | -0.262 | -0.135 | -0.921 |
| -1.635000000000072 | -0.257 | -0.141 | -0.922 |
| -1.630000000000072 | -0.252 | -0.147 | -0.924 |
| -1.625000000000072 | -0.248 | -0.154 | -0.925 |
| -1.620000000000072 | -0.243 | -0.159 | -0.926 |
| -1.615000000000072 | -0.238 | -0.165 | -0.928 |
| -1.610000000000072 | -0.233 | -0.171 | -0.929 |
| -1.605000000000072 | -0.227 | -0.177 | -0.93 |
| -1.600000000000072 | -0.222 | -0.182 | -0.931 |
| -1.595000000000073 | -0.217 | -0.188 | -0.933 |
| -1.590000000000073 | -0.212 | -0.193 | -0.934 |
| -1.585000000000073 | -0.207 | -0.199 | -0.935 |
| -1.580000000000073 | -0.202 | -0.204 | -0.936 |
| -1.575000000000073 | -0.196 | -0.209 | -0.937 |
| -1.570000000000073 | -0.191 | -0.214 | -0.939 |
| -1.565000000000073 | -0.186 | -0.219 | -0.94 |
| -1.560000000000073 | -0.18 | -0.224 | -0.941 |
| -1.555000000000073 | -0.175 | -0.229 | -0.942 |
| -1.550000000000074 | -0.169 | -0.234 | -0.943 |
| -1.545000000000074 | -0.164 | -0.239 | -0.945 |
| -1.540000000000074 | -0.158 | -0.244 | -0.946 |
| -1.535000000000074 | -0.152 | -0.248 | -0.947 |
| -1.530000000000074 | -0.147 | -0.253 | -0.948 |
| -1.525000000000074 | -0.141 | -0.258 | -0.949 |
| -1.520000000000074 | -0.135 | -0.262 | -0.95 |
| -1.515000000000074 | -0.129 | -0.267 | -0.951 |
| -1.510000000000074 | -0.123 | -0.271 | -0.953 |
| -1.505000000000074 | -0.118 | -0.275 | -0.954 |
| -1.500000000000075 | -0.112 | -0.28 | -0.955 |
| -1.495000000000075 | -0.106 | -0.284 | -0.956 |
| -1.490000000000075 | -0.099 | -0.288 | -0.957 |
| -1.485000000000075 | -0.093 | -0.292 | -0.958 |
| -1.480000000000075 | -0.087 | -0.297 | -0.959 |
| -1.475000000000075 | -0.081 | -0.301 | -0.96 |
| -1.470000000000075 | -0.075 | -0.305 | -0.961 |
| -1.465000000000075 | -0.068 | -0.309 | -0.962 |
| -1.460000000000075 | -0.062 | -0.313 | -0.963 |
| -1.455000000000076 | -0.055 | -0.316 | -0.965 |
| -1.450000000000076 | -0.049 | -0.32 | -0.966 |
| -1.445000000000076 | -0.042 | -0.324 | -0.967 |
| -1.440000000000076 | -0.036 | -0.328 | -0.968 |
| -1.435000000000076 | -0.029 | -0.332 | -0.969 |
| -1.430000000000076 | -0.022 | -0.335 | -0.97 |
| -1.425000000000076 | -0.015 | -0.339 | -0.971 |
| -1.420000000000076 | -0.008 | -0.342 | -0.972 |
| -1.415000000000076 | -0.001 | -0.346 | -0.973 |
| -1.410000000000077 | 0.006 | -0.35 | -0.974 |
| -1.405000000000077 | 0.013 | -0.353 | -0.975 |
| -1.400000000000077 | 0.02 | -0.356 | -0.976 |
| -1.395000000000077 | 0.028 | -0.36 | -0.977 |
| -1.390000000000077 | 0.035 | -0.363 | -0.978 |
| -1.385000000000077 | 0.043 | -0.367 | -0.979 |
| -1.380000000000077 | 0.05 | -0.37 | -0.98 |
| -1.375000000000077 | 0.058 | -0.373 | -0.981 |
| -1.370000000000077 | 0.066 | -0.376 | -0.982 |
| -1.365000000000077 | 0.074 | -0.38 | -0.983 |
| -1.360000000000078 | 0.081 | -0.383 | -0.984 |
| -1.355000000000078 | 0.09 | -0.386 | -0.985 |
| -1.350000000000078 | 0.098 | -0.389 | -0.985 |
| -1.345000000000078 | 0.106 | -0.392 | -0.986 |
| -1.340000000000078 | 0.114 | -0.395 | -0.987 |
| -1.335000000000078 | 0.123 | -0.398 | -0.988 |
| -1.330000000000078 | 0.131 | -0.401 | -0.989 |
| -1.325000000000078 | 0.14 | -0.404 | -0.99 |
| -1.320000000000078 | 0.149 | -0.407 | -0.991 |
| -1.315000000000079 | 0.158 | -0.41 | -0.992 |
| -1.310000000000079 | 0.167 | -0.413 | -0.993 |
| -1.305000000000079 | 0.176 | -0.416 | -0.994 |
| -1.300000000000079 | 0.186 | -0.419 | -0.995 |
| -1.295000000000079 | 0.195 | -0.421 | -0.996 |
| -1.29000000000008 | 0.205 | -0.424 | -0.996 |
| -1.285000000000079 | 0.214 | -0.427 | -0.997 |
| -1.280000000000079 | 0.224 | -0.43 | -0.998 |
| -1.275000000000079 | 0.235 | -0.432 | -0.999 |
| -1.270000000000079 | 0.245 | -0.435 | -1 |
| -1.26500000000008 | 0.255 | -0.438 | -1.001 |
| -1.26000000000008 | 0.266 | -0.44 | -1.002 |
| -1.25500000000008 | 0.277 | -0.443 | -1.002 |
| -1.25000000000008 | 0.288 | -0.445 | -1.003 |
| -1.24500000000008 | 0.299 | -0.448 | -1.004 |
| -1.24000000000008 | 0.31 | -0.451 | -1.005 |
| -1.23500000000008 | 0.322 | -0.453 | -1.006 |
| -1.23000000000008 | 0.334 | -0.456 | -1.007 |
| -1.22500000000008 | 0.346 | -0.458 | -1.007 |
| -1.220000000000081 | 0.358 | -0.46 | -1.008 |
| -1.215000000000081 | 0.371 | -0.463 | -1.009 |
| -1.210000000000081 | 0.384 | -0.465 | -1.01 |
| -1.205000000000081 | 0.397 | -0.468 | -1.011 |
| -1.200000000000081 | 0.41 | -0.47 | -1.011 |
| -1.195000000000081 | 0.424 | -0.472 | -1.012 |
| -1.190000000000081 | 0.438 | -0.475 | -1.013 |
| -1.185000000000081 | 0.453 | -0.477 | -1.014 |
| -1.180000000000081 | 0.468 | -0.479 | -1.015 |
| -1.175000000000082 | 0.483 | -0.481 | -1.015 |
| -1.170000000000082 | 0.499 | -0.484 | -1.016 |
| -1.165000000000082 | 0.515 | -0.486 | -1.017 |
| -1.160000000000082 | 0.531 | -0.488 | -1.018 |
| -1.155000000000082 | 0.548 | -0.49 | -1.018 |
| -1.150000000000082 | 0.566 | -0.492 | -1.019 |
| -1.145000000000082 | 0.584 | -0.495 | -1.02 |
| -1.140000000000082 | 0.603 | -0.497 | -1.021 |
| -1.135000000000082 | 0.622 | -0.499 | -1.021 |
| -1.130000000000082 | 0.642 | -0.501 | -1.022 |
| -1.125000000000083 | 0.663 | -0.503 | -1.023 |
| -1.120000000000083 | 0.684 | -0.505 | -1.024 |
| -1.115000000000083 | 0.707 | -0.507 | -1.024 |
| -1.110000000000083 | 0.73 | -0.509 | -1.025 |
| -1.105000000000083 | 0.755 | -0.511 | -1.026 |
| -1.100000000000083 | 0.78 | -0.513 | -1.026 |
| -1.095000000000083 | 0.807 | -0.515 | -1.027 |
| -1.090000000000083 | 0.835 | -0.517 | -1.028 |
| -1.085000000000083 | 0.865 | -0.519 | -1.029 |
| -1.080000000000084 | 0.897 | -0.521 | -1.029 |
| -1.075000000000084 | 0.93 | -0.523 | -1.03 |
| -1.070000000000084 | 0.966 | -0.525 | -1.031 |
| -1.065000000000084 | 1.004 | -0.526 | -1.031 |
| -1.060000000000084 | 1.045 | -0.528 | -1.032 |
| -1.055000000000084 | 1.09 | -0.53 | -1.033 |
| -1.050000000000084 | 1.139 | -0.532 | -1.033 |
| -1.045000000000084 | 1.193 | -0.534 | -1.034 |
| -1.040000000000084 | 1.253 | -0.536 | -1.035 |
| -1.035000000000085 | 1.321 | -0.537 | -1.035 |
| -1.030000000000085 | 1.399 | -0.539 | -1.036 |
| -1.025000000000085 | 1.492 | -0.541 | -1.037 |
| -1.020000000000085 | 1.604 | -0.543 | -1.037 |
| -1.015000000000085 | 1.75 | -0.544 | -1.038 |
| -1.010000000000085 | 1.954 | -0.546 | -1.038 |
| -1.005000000000085 | 2.301 | -0.548 | -1.039 |
| -1.000000000000085 | 14.7 | -0.549 | -1.04 |
| -0.995000000000085 | 2.304 | -0.551 | -1.04 |
| -0.990000000000085 | 1.959 | -0.553 | -1.041 |
| -0.985000000000085 | 1.757 | -0.554 | -1.042 |
| -0.980000000000085 | 1.614 | -0.556 | -1.042 |
| -0.975000000000085 | 1.504 | -0.557 | -1.043 |
| -0.970000000000085 | 1.414 | -0.559 | -1.043 |
| -0.965000000000085 | 1.338 | -0.561 | -1.044 |
| -0.960000000000085 | 1.273 | -0.562 | -1.045 |
| -0.955000000000085 | 1.215 | -0.564 | -1.045 |
| -0.950000000000085 | 1.164 | -0.565 | -1.046 |
| -0.945000000000085 | 1.118 | -0.567 | -1.046 |
| -0.940000000000085 | 1.075 | -0.568 | -1.047 |
| -0.935000000000085 | 1.037 | -0.57 | -1.048 |
| -0.930000000000085 | 1.001 | -0.571 | -1.048 |
| -0.925000000000085 | 0.968 | -0.573 | -1.049 |
| -0.920000000000085 | 0.937 | -0.574 | -1.049 |
| -0.915000000000085 | 0.908 | -0.576 | -1.05 |
| -0.910000000000085 | 0.88 | -0.577 | -1.05 |
| -0.905000000000085 | 0.855 | -0.579 | -1.051 |
| -0.900000000000085 | 0.83 | -0.58 | -1.051 |
| -0.895000000000085 | 0.807 | -0.581 | -1.052 |
| -0.890000000000085 | 0.785 | -0.583 | -1.053 |
| -0.885000000000085 | 0.764 | -0.584 | -1.053 |
| -0.880000000000085 | 0.744 | -0.586 | -1.054 |
| -0.875000000000085 | 0.725 | -0.587 | -1.054 |
| -0.870000000000085 | 0.707 | -0.588 | -1.055 |
| -0.865000000000085 | 0.69 | -0.59 | -1.055 |
| -0.860000000000085 | 0.673 | -0.591 | -1.056 |
| -0.855000000000085 | 0.657 | -0.592 | -1.056 |
| -0.850000000000085 | 0.641 | -0.594 | -1.057 |
| -0.845000000000085 | 0.626 | -0.595 | -1.057 |
| -0.840000000000085 | 0.611 | -0.596 | -1.058 |
| -0.835000000000085 | 0.597 | -0.597 | -1.058 |
| -0.830000000000085 | 0.584 | -0.599 | -1.059 |
| -0.825000000000085 | 0.571 | -0.6 | -1.059 |
| -0.820000000000085 | 0.558 | -0.601 | -1.06 |
| -0.815000000000085 | 0.546 | -0.602 | -1.06 |
| -0.810000000000085 | 0.534 | -0.604 | -1.061 |
| -0.805000000000085 | 0.522 | -0.605 | -1.061 |
| -0.800000000000085 | 0.511 | -0.606 | -1.062 |
| -0.795000000000085 | 0.5 | -0.607 | -1.062 |
| -0.790000000000085 | 0.489 | -0.608 | -1.063 |
| -0.785000000000085 | 0.479 | -0.609 | -1.063 |
| -0.780000000000085 | 0.469 | -0.611 | -1.064 |
| -0.775000000000085 | 0.459 | -0.612 | -1.064 |
| -0.770000000000085 | 0.449 | -0.613 | -1.065 |
| -0.765000000000085 | 0.44 | -0.614 | -1.065 |
| -0.760000000000085 | 0.431 | -0.615 | -1.065 |
| -0.755000000000085 | 0.422 | -0.616 | -1.066 |
| -0.750000000000085 | 0.413 | -0.617 | -1.066 |
| -0.745000000000085 | 0.405 | -0.618 | -1.067 |
| -0.740000000000085 | 0.397 | -0.62 | -1.067 |
| -0.735000000000085 | 0.389 | -0.621 | -1.068 |
| -0.730000000000085 | 0.381 | -0.622 | -1.068 |
| -0.725000000000085 | 0.373 | -0.623 | -1.069 |
| -0.720000000000085 | 0.365 | -0.624 | -1.069 |
| -0.715000000000085 | 0.358 | -0.625 | -1.069 |
| -0.710000000000085 | 0.351 | -0.626 | -1.07 |
| -0.705000000000085 | 0.344 | -0.627 | -1.07 |
| -0.700000000000085 | 0.337 | -0.628 | -1.071 |
| -0.695000000000085 | 0.33 | -0.629 | -1.071 |
| -0.690000000000085 | 0.323 | -0.63 | -1.071 |
| -0.685000000000085 | 0.317 | -0.631 | -1.072 |
| -0.680000000000085 | 0.31 | -0.632 | -1.072 |
| -0.675000000000085 | 0.304 | -0.633 | -1.073 |
| -0.670000000000085 | 0.298 | -0.634 | -1.073 |
| -0.665000000000085 | 0.292 | -0.635 | -1.073 |
| -0.660000000000085 | 0.286 | -0.635 | -1.074 |
| -0.655000000000085 | 0.28 | -0.636 | -1.074 |
| -0.650000000000085 | 0.275 | -0.637 | -1.075 |
| -0.645000000000085 | 0.269 | -0.638 | -1.075 |
| -0.640000000000085 | 0.263 | -0.639 | -1.075 |
| -0.635000000000085 | 0.258 | -0.64 | -1.076 |
| -0.630000000000085 | 0.253 | -0.641 | -1.076 |
| -0.625000000000085 | 0.248 | -0.642 | -1.076 |
| -0.620000000000085 | 0.243 | -0.643 | -1.077 |
| -0.615000000000085 | 0.238 | -0.643 | -1.077 |
| -0.610000000000085 | 0.233 | -0.644 | -1.078 |
| -0.605000000000085 | 0.228 | -0.645 | -1.078 |
| -0.600000000000085 | 0.223 | -0.646 | -1.078 |
| -0.595000000000085 | 0.218 | -0.647 | -1.079 |
| -0.590000000000085 | 0.214 | -0.648 | -1.079 |
| -0.585000000000085 | 0.209 | -0.648 | -1.079 |
| -0.580000000000085 | 0.205 | -0.649 | -1.08 |
| -0.575000000000085 | 0.201 | -0.65 | -1.08 |
| -0.570000000000085 | 0.196 | -0.651 | -1.08 |
| -0.565000000000085 | 0.192 | -0.652 | -1.081 |
| -0.560000000000085 | 0.188 | -0.652 | -1.081 |
| -0.555000000000085 | 0.184 | -0.653 | -1.081 |
| -0.550000000000085 | 0.18 | -0.654 | -1.082 |
| -0.545000000000085 | 0.176 | -0.655 | -1.082 |
| -0.540000000000085 | 0.172 | -0.655 | -1.082 |
| -0.535000000000085 | 0.169 | -0.656 | -1.082 |
| -0.530000000000085 | 0.165 | -0.657 | -1.083 |
| -0.525000000000085 | 0.161 | -0.657 | -1.083 |
| -0.520000000000085 | 0.158 | -0.658 | -1.083 |
| -0.515000000000085 | 0.154 | -0.659 | -1.084 |
| -0.510000000000085 | 0.151 | -0.66 | -1.084 |
| -0.505000000000085 | 0.147 | -0.66 | -1.084 |
| -0.500000000000085 | 0.144 | -0.661 | -1.085 |
| -0.495000000000085 | 0.141 | -0.662 | -1.085 |
| -0.490000000000085 | 0.137 | -0.662 | -1.085 |
| -0.485000000000085 | 0.134 | -0.663 | -1.085 |
| -0.480000000000085 | 0.131 | -0.663 | -1.086 |
| -0.475000000000085 | 0.128 | -0.664 | -1.086 |
| -0.470000000000085 | 0.125 | -0.665 | -1.086 |
| -0.465000000000085 | 0.122 | -0.665 | -1.086 |
| -0.460000000000085 | 0.119 | -0.666 | -1.087 |
| -0.455000000000085 | 0.116 | -0.667 | -1.087 |
| -0.450000000000085 | 0.113 | -0.667 | -1.087 |
| -0.445000000000085 | 0.11 | -0.668 | -1.087 |
| -0.440000000000085 | 0.108 | -0.668 | -1.088 |
| -0.435000000000085 | 0.105 | -0.669 | -1.088 |
| -0.430000000000085 | 0.102 | -0.669 | -1.088 |
| -0.425000000000085 | 0.1 | -0.67 | -1.088 |
| -0.420000000000085 | 0.097 | -0.671 | -1.089 |
| -0.415000000000085 | 0.095 | -0.671 | -1.089 |
| -0.410000000000085 | 0.092 | -0.672 | -1.089 |
| -0.405000000000085 | 0.09 | -0.672 | -1.089 |
| -0.400000000000085 | 0.087 | -0.673 | -1.09 |
| -0.395000000000085 | 0.085 | -0.673 | -1.09 |
| -0.390000000000085 | 0.082 | -0.674 | -1.09 |
| -0.385000000000085 | 0.08 | -0.674 | -1.09 |
| -0.380000000000085 | 0.078 | -0.675 | -1.091 |
| -0.375000000000085 | 0.076 | -0.675 | -1.091 |
| -0.370000000000085 | 0.074 | -0.676 | -1.091 |
| -0.365000000000085 | 0.071 | -0.676 | -1.091 |
| -0.360000000000085 | 0.069 | -0.677 | -1.091 |
| -0.355000000000085 | 0.067 | -0.677 | -1.092 |
| -0.350000000000085 | 0.065 | -0.678 | -1.092 |
| -0.345000000000085 | 0.063 | -0.678 | -1.092 |
| -0.340000000000085 | 0.061 | -0.678 | -1.092 |
| -0.335000000000085 | 0.06 | -0.679 | -1.092 |
| -0.330000000000085 | 0.058 | -0.679 | -1.093 |
| -0.325000000000085 | 0.056 | -0.68 | -1.093 |
| -0.320000000000085 | 0.054 | -0.68 | -1.093 |
| -0.315000000000085 | 0.052 | -0.681 | -1.093 |
| -0.310000000000085 | 0.051 | -0.681 | -1.093 |
| -0.305000000000085 | 0.049 | -0.681 | -1.093 |
| -0.300000000000085 | 0.047 | -0.682 | -1.094 |
| -0.295000000000085 | 0.046 | -0.682 | -1.094 |
| -0.290000000000085 | 0.044 | -0.683 | -1.094 |
| -0.285000000000085 | 0.042 | -0.683 | -1.094 |
| -0.280000000000085 | 0.041 | -0.683 | -1.094 |
| -0.275000000000085 | 0.039 | -0.684 | -1.094 |
| -0.270000000000085 | 0.038 | -0.684 | -1.095 |
| -0.265000000000085 | 0.036 | -0.684 | -1.095 |
| -0.260000000000085 | 0.035 | -0.685 | -1.095 |
| -0.255000000000085 | 0.034 | -0.685 | -1.095 |
| -0.250000000000085 | 0.032 | -0.685 | -1.095 |
| -0.245000000000085 | 0.031 | -0.686 | -1.095 |
| -0.240000000000085 | 0.03 | -0.686 | -1.095 |
| -0.235000000000085 | 0.028 | -0.686 | -1.096 |
| -0.230000000000085 | 0.027 | -0.686 | -1.096 |
| -0.225000000000085 | 0.026 | -0.687 | -1.096 |
| -0.220000000000085 | 0.025 | -0.687 | -1.096 |
| -0.215000000000085 | 0.024 | -0.687 | -1.096 |
| -0.210000000000085 | 0.023 | -0.688 | -1.096 |
| -0.205000000000085 | 0.021 | -0.688 | -1.096 |
| -0.200000000000085 | 0.02 | -0.688 | -1.096 |
| -0.195000000000085 | 0.019 | -0.688 | -1.096 |
| -0.190000000000085 | 0.018 | -0.689 | -1.097 |
| -0.185000000000085 | 0.017 | -0.689 | -1.097 |
| -0.180000000000085 | 0.016 | -0.689 | -1.097 |
| -0.175000000000085 | 0.016 | -0.689 | -1.097 |
| -0.170000000000085 | 0.015 | -0.69 | -1.097 |
| -0.165000000000085 | 0.014 | -0.69 | -1.097 |
| -0.160000000000085 | 0.013 | -0.69 | -1.097 |
| -0.155000000000084 | 0.012 | -0.69 | -1.097 |
| -0.150000000000084 | 0.011 | -0.69 | -1.097 |
| -0.145000000000084 | 0.011 | -0.691 | -1.097 |
| -0.140000000000084 | 0.01 | -0.691 | -1.098 |
| -0.135000000000084 | 0.009 | -0.691 | -1.098 |
| -0.130000000000084 | 0.009 | -0.691 | -1.098 |
| -0.125000000000084 | 0.008 | -0.691 | -1.098 |
| -0.120000000000084 | 0.007 | -0.691 | -1.098 |
| -0.115000000000084 | 0.007 | -0.691 | -1.098 |
| -0.110000000000084 | 0.006 | -0.692 | -1.098 |
| -0.105000000000084 | 0.006 | -0.692 | -1.098 |
| -0.100000000000084 | 0.005 | -0.692 | -1.098 |
| -0.0950000000000844 | 0.005 | -0.692 | -1.098 |
| -0.0900000000000844 | 0.004 | -0.692 | -1.098 |
| -0.0850000000000844 | 0.004 | -0.692 | -1.098 |
| -0.0800000000000844 | 0.003 | -0.692 | -1.098 |
| -0.0750000000000844 | 0.003 | -0.692 | -1.098 |
| -0.0700000000000844 | 0.002 | -0.693 | -1.098 |
| -0.0650000000000844 | 0.002 | -0.693 | -1.098 |
| -0.0600000000000844 | 0.002 | -0.693 | -1.098 |
| -0.0550000000000844 | 0.002 | -0.693 | -1.098 |
| -0.0500000000000844 | 0.001 | -0.693 | -1.098 |
| -0.0450000000000844 | 0.001 | -0.693 | -1.098 |
| -0.0400000000000844 | 0.001 | -0.693 | -1.099 |
| -0.0350000000000844 | 0.001 | -0.693 | -1.099 |
| -0.0300000000000844 | 0 | -0.693 | -1.099 |
| -0.0250000000000844 | 0 | -0.693 | -1.099 |
| -0.0200000000000844 | 0 | -0.693 | -1.099 |
| -0.0150000000000844 | 0 | -0.693 | -1.099 |
| -0.0100000000000844 | 0 | -0.693 | -1.099 |
| -0.00500000000008444 | 0 | -0.693 | -1.099 |
| -8.4444604087075e-14 | 0 | -0.693 | -1.099 |
| 0.00499999999991555 | 0 | -0.693 | -1.099 |
| 0.00999999999991555 | 0 | -0.693 | -1.099 |
| 0.0149999999999156 | 0 | -0.693 | -1.099 |
| 0.0199999999999156 | 0 | -0.693 | -1.099 |
| 0.0249999999999156 | 0 | -0.693 | -1.099 |
| 0.0299999999999156 | 0 | -0.693 | -1.099 |
| 0.0349999999999155 | 0.001 | -0.693 | -1.099 |
| 0.0399999999999155 | 0.001 | -0.693 | -1.099 |
| 0.0449999999999155 | 0.001 | -0.693 | -1.098 |
| 0.0499999999999155 | 0.001 | -0.693 | -1.098 |
| 0.0549999999999155 | 0.002 | -0.693 | -1.098 |
| 0.0599999999999155 | 0.002 | -0.693 | -1.098 |
| 0.0649999999999155 | 0.002 | -0.693 | -1.098 |
| 0.0699999999999155 | 0.002 | -0.693 | -1.098 |
| 0.0749999999999155 | 0.003 | -0.692 | -1.098 |
| 0.0799999999999155 | 0.003 | -0.692 | -1.098 |
| 0.0849999999999155 | 0.004 | -0.692 | -1.098 |
| 0.0899999999999155 | 0.004 | -0.692 | -1.098 |
| 0.0949999999999155 | 0.005 | -0.692 | -1.098 |
| 0.0999999999999155 | 0.005 | -0.692 | -1.098 |
| 0.104999999999916 | 0.006 | -0.692 | -1.098 |
| 0.109999999999916 | 0.006 | -0.692 | -1.098 |
| 0.114999999999916 | 0.007 | -0.691 | -1.098 |
| 0.119999999999916 | 0.007 | -0.691 | -1.098 |
| 0.124999999999916 | 0.008 | -0.691 | -1.098 |
| 0.129999999999916 | 0.009 | -0.691 | -1.098 |
| 0.134999999999916 | 0.009 | -0.691 | -1.098 |
| 0.139999999999916 | 0.01 | -0.691 | -1.098 |
| 0.144999999999916 | 0.011 | -0.691 | -1.097 |
| 0.149999999999916 | 0.011 | -0.69 | -1.097 |
| 0.154999999999916 | 0.012 | -0.69 | -1.097 |
| 0.159999999999916 | 0.013 | -0.69 | -1.097 |
| 0.164999999999916 | 0.014 | -0.69 | -1.097 |
| 0.169999999999916 | 0.015 | -0.69 | -1.097 |
| 0.174999999999916 | 0.016 | -0.689 | -1.097 |
| 0.179999999999916 | 0.016 | -0.689 | -1.097 |
| 0.184999999999916 | 0.017 | -0.689 | -1.097 |
| 0.189999999999916 | 0.018 | -0.689 | -1.097 |
| 0.194999999999916 | 0.019 | -0.688 | -1.096 |
| 0.199999999999916 | 0.02 | -0.688 | -1.096 |
| 0.204999999999916 | 0.021 | -0.688 | -1.096 |
| 0.209999999999916 | 0.023 | -0.688 | -1.096 |
| 0.214999999999916 | 0.024 | -0.687 | -1.096 |
| 0.219999999999916 | 0.025 | -0.687 | -1.096 |
| 0.224999999999916 | 0.026 | -0.687 | -1.096 |
| 0.229999999999916 | 0.027 | -0.686 | -1.096 |
| 0.234999999999916 | 0.028 | -0.686 | -1.096 |
| 0.239999999999916 | 0.03 | -0.686 | -1.095 |
| 0.244999999999916 | 0.031 | -0.686 | -1.095 |
| 0.249999999999916 | 0.032 | -0.685 | -1.095 |
| 0.254999999999916 | 0.034 | -0.685 | -1.095 |
| 0.259999999999916 | 0.035 | -0.685 | -1.095 |
| 0.264999999999916 | 0.036 | -0.684 | -1.095 |
| 0.269999999999916 | 0.038 | -0.684 | -1.095 |
| 0.274999999999916 | 0.039 | -0.684 | -1.094 |
| 0.279999999999916 | 0.041 | -0.683 | -1.094 |
| 0.284999999999916 | 0.042 | -0.683 | -1.094 |
| 0.289999999999916 | 0.044 | -0.683 | -1.094 |
| 0.294999999999916 | 0.046 | -0.682 | -1.094 |
| 0.299999999999916 | 0.047 | -0.682 | -1.094 |
| 0.304999999999916 | 0.049 | -0.681 | -1.093 |
| 0.309999999999916 | 0.051 | -0.681 | -1.093 |
| 0.314999999999916 | 0.052 | -0.681 | -1.093 |
| 0.319999999999916 | 0.054 | -0.68 | -1.093 |
| 0.324999999999916 | 0.056 | -0.68 | -1.093 |
| 0.329999999999916 | 0.058 | -0.679 | -1.093 |
| 0.334999999999916 | 0.06 | -0.679 | -1.092 |
| 0.339999999999916 | 0.061 | -0.678 | -1.092 |
| 0.344999999999916 | 0.063 | -0.678 | -1.092 |
| 0.349999999999916 | 0.065 | -0.678 | -1.092 |
| 0.354999999999916 | 0.067 | -0.677 | -1.092 |
| 0.359999999999916 | 0.069 | -0.677 | -1.091 |
| 0.364999999999916 | 0.071 | -0.676 | -1.091 |
| 0.369999999999916 | 0.074 | -0.676 | -1.091 |
| 0.374999999999916 | 0.076 | -0.675 | -1.091 |
| 0.379999999999916 | 0.078 | -0.675 | -1.091 |
| 0.384999999999916 | 0.08 | -0.674 | -1.09 |
| 0.389999999999916 | 0.082 | -0.674 | -1.09 |
| 0.394999999999916 | 0.085 | -0.673 | -1.09 |
| 0.399999999999916 | 0.087 | -0.673 | -1.09 |
| 0.404999999999916 | 0.09 | -0.672 | -1.089 |
| 0.409999999999916 | 0.092 | -0.672 | -1.089 |
| 0.414999999999916 | 0.095 | -0.671 | -1.089 |
| 0.419999999999916 | 0.097 | -0.671 | -1.089 |
| 0.424999999999916 | 0.1 | -0.67 | -1.088 |
| 0.429999999999916 | 0.102 | -0.669 | -1.088 |
| 0.434999999999916 | 0.105 | -0.669 | -1.088 |
| 0.439999999999916 | 0.108 | -0.668 | -1.088 |
| 0.444999999999916 | 0.11 | -0.668 | -1.087 |
| 0.449999999999916 | 0.113 | -0.667 | -1.087 |
| 0.454999999999916 | 0.116 | -0.667 | -1.087 |
| 0.459999999999916 | 0.119 | -0.666 | -1.087 |
| 0.464999999999916 | 0.122 | -0.665 | -1.086 |
| 0.469999999999916 | 0.125 | -0.665 | -1.086 |
| 0.474999999999916 | 0.128 | -0.664 | -1.086 |
| 0.479999999999916 | 0.131 | -0.663 | -1.086 |
| 0.484999999999916 | 0.134 | -0.663 | -1.085 |
| 0.489999999999916 | 0.137 | -0.662 | -1.085 |
| 0.494999999999916 | 0.141 | -0.662 | -1.085 |
| 0.499999999999916 | 0.144 | -0.661 | -1.085 |
| 0.504999999999916 | 0.147 | -0.66 | -1.084 |
| 0.509999999999916 | 0.151 | -0.66 | -1.084 |
| 0.514999999999916 | 0.154 | -0.659 | -1.084 |
| 0.519999999999916 | 0.158 | -0.658 | -1.083 |
| 0.524999999999916 | 0.161 | -0.657 | -1.083 |
| 0.529999999999916 | 0.165 | -0.657 | -1.083 |
| 0.534999999999916 | 0.169 | -0.656 | -1.082 |
| 0.539999999999916 | 0.172 | -0.655 | -1.082 |
| 0.544999999999916 | 0.176 | -0.655 | -1.082 |
| 0.549999999999916 | 0.18 | -0.654 | -1.082 |
| 0.554999999999916 | 0.184 | -0.653 | -1.081 |
| 0.559999999999916 | 0.188 | -0.652 | -1.081 |
| 0.564999999999916 | 0.192 | -0.652 | -1.081 |
| 0.569999999999916 | 0.196 | -0.651 | -1.08 |
| 0.574999999999916 | 0.201 | -0.65 | -1.08 |
| 0.579999999999916 | 0.205 | -0.649 | -1.08 |
| 0.584999999999916 | 0.209 | -0.648 | -1.079 |
| 0.589999999999916 | 0.214 | -0.648 | -1.079 |
| 0.594999999999916 | 0.218 | -0.647 | -1.079 |
| 0.599999999999916 | 0.223 | -0.646 | -1.078 |
| 0.604999999999916 | 0.228 | -0.645 | -1.078 |
| 0.609999999999916 | 0.233 | -0.644 | -1.078 |
| 0.614999999999916 | 0.238 | -0.643 | -1.077 |
| 0.619999999999916 | 0.243 | -0.643 | -1.077 |
| 0.624999999999916 | 0.248 | -0.642 | -1.076 |
| 0.629999999999916 | 0.253 | -0.641 | -1.076 |
| 0.634999999999916 | 0.258 | -0.64 | -1.076 |
| 0.639999999999916 | 0.263 | -0.639 | -1.075 |
| 0.644999999999916 | 0.269 | -0.638 | -1.075 |
| 0.649999999999916 | 0.275 | -0.637 | -1.075 |
| 0.654999999999916 | 0.28 | -0.636 | -1.074 |
| 0.659999999999916 | 0.286 | -0.635 | -1.074 |
| 0.664999999999916 | 0.292 | -0.635 | -1.073 |
| 0.669999999999916 | 0.298 | -0.634 | -1.073 |
| 0.674999999999916 | 0.304 | -0.633 | -1.073 |
| 0.679999999999916 | 0.31 | -0.632 | -1.072 |
| 0.684999999999916 | 0.317 | -0.631 | -1.072 |
| 0.689999999999916 | 0.323 | -0.63 | -1.071 |
| 0.694999999999916 | 0.33 | -0.629 | -1.071 |
| 0.699999999999916 | 0.337 | -0.628 | -1.071 |
| 0.704999999999916 | 0.344 | -0.627 | -1.07 |
| 0.709999999999916 | 0.351 | -0.626 | -1.07 |
| 0.714999999999916 | 0.358 | -0.625 | -1.069 |
| 0.719999999999916 | 0.365 | -0.624 | -1.069 |
| 0.724999999999916 | 0.373 | -0.623 | -1.069 |
| 0.729999999999916 | 0.381 | -0.622 | -1.068 |
| 0.734999999999916 | 0.389 | -0.621 | -1.068 |
| 0.739999999999916 | 0.397 | -0.62 | -1.067 |
| 0.744999999999916 | 0.405 | -0.618 | -1.067 |
| 0.749999999999916 | 0.413 | -0.617 | -1.066 |
| 0.754999999999916 | 0.422 | -0.616 | -1.066 |
| 0.759999999999916 | 0.431 | -0.615 | -1.065 |
| 0.764999999999916 | 0.44 | -0.614 | -1.065 |
| 0.769999999999916 | 0.449 | -0.613 | -1.065 |
| 0.774999999999916 | 0.459 | -0.612 | -1.064 |
| 0.779999999999916 | 0.469 | -0.611 | -1.064 |
| 0.784999999999916 | 0.479 | -0.609 | -1.063 |
| 0.789999999999916 | 0.489 | -0.608 | -1.063 |
| 0.794999999999916 | 0.5 | -0.607 | -1.062 |
| 0.799999999999916 | 0.511 | -0.606 | -1.062 |
| 0.804999999999916 | 0.522 | -0.605 | -1.061 |
| 0.809999999999916 | 0.534 | -0.604 | -1.061 |
| 0.814999999999916 | 0.546 | -0.602 | -1.06 |
| 0.819999999999916 | 0.558 | -0.601 | -1.06 |
| 0.824999999999916 | 0.571 | -0.6 | -1.059 |
| 0.829999999999916 | 0.584 | -0.599 | -1.059 |
| 0.834999999999916 | 0.597 | -0.597 | -1.058 |
| 0.839999999999916 | 0.611 | -0.596 | -1.058 |
| 0.844999999999916 | 0.626 | -0.595 | -1.057 |
| 0.849999999999916 | 0.641 | -0.594 | -1.057 |
| 0.854999999999916 | 0.657 | -0.592 | -1.056 |
| 0.859999999999916 | 0.673 | -0.591 | -1.056 |
| 0.864999999999916 | 0.69 | -0.59 | -1.055 |
| 0.869999999999916 | 0.707 | -0.588 | -1.055 |
| 0.874999999999916 | 0.725 | -0.587 | -1.054 |
| 0.879999999999916 | 0.744 | -0.586 | -1.054 |
| 0.884999999999916 | 0.764 | -0.584 | -1.053 |
| 0.889999999999916 | 0.785 | -0.583 | -1.053 |
| 0.894999999999916 | 0.807 | -0.581 | -1.052 |
| 0.899999999999916 | 0.83 | -0.58 | -1.051 |
| 0.904999999999916 | 0.855 | -0.579 | -1.051 |
| 0.909999999999916 | 0.88 | -0.577 | -1.05 |
| 0.914999999999916 | 0.908 | -0.576 | -1.05 |
| 0.919999999999916 | 0.937 | -0.574 | -1.049 |
| 0.924999999999916 | 0.968 | -0.573 | -1.049 |
| 0.929999999999916 | 1.001 | -0.571 | -1.048 |
| 0.934999999999916 | 1.037 | -0.57 | -1.048 |
| 0.939999999999916 | 1.075 | -0.568 | -1.047 |
| 0.944999999999916 | 1.118 | -0.567 | -1.046 |
| 0.949999999999916 | 1.164 | -0.565 | -1.046 |
| 0.954999999999916 | 1.215 | -0.564 | -1.045 |
| 0.959999999999916 | 1.273 | -0.562 | -1.045 |
| 0.964999999999916 | 1.338 | -0.561 | -1.044 |
| 0.969999999999916 | 1.414 | -0.559 | -1.043 |
| 0.974999999999916 | 1.504 | -0.557 | -1.043 |
| 0.979999999999916 | 1.614 | -0.556 | -1.042 |
| 0.984999999999916 | 1.757 | -0.554 | -1.042 |
| 0.989999999999916 | 1.959 | -0.553 | -1.041 |
| 0.994999999999916 | 2.304 | -0.551 | -1.04 |
| 0.999999999999916 | 14.709 | -0.549 | -1.04 |
| 1.004999999999916 | 2.301 | -0.548 | -1.039 |
| 1.009999999999916 | 1.954 | -0.546 | -1.038 |
| 1.014999999999916 | 1.75 | -0.544 | -1.038 |
| 1.019999999999916 | 1.604 | -0.543 | -1.037 |
| 1.024999999999916 | 1.492 | -0.541 | -1.037 |
| 1.029999999999916 | 1.399 | -0.539 | -1.036 |
| 1.034999999999916 | 1.321 | -0.537 | -1.035 |
| 1.039999999999915 | 1.253 | -0.536 | -1.035 |
| 1.044999999999915 | 1.193 | -0.534 | -1.034 |
| 1.049999999999915 | 1.139 | -0.532 | -1.033 |
| 1.054999999999915 | 1.09 | -0.53 | -1.033 |
| 1.059999999999915 | 1.045 | -0.528 | -1.032 |
| 1.064999999999915 | 1.004 | -0.526 | -1.031 |
| 1.069999999999915 | 0.966 | -0.525 | -1.031 |
| 1.074999999999915 | 0.93 | -0.523 | -1.03 |
| 1.079999999999915 | 0.897 | -0.521 | -1.029 |
| 1.084999999999914 | 0.865 | -0.519 | -1.029 |
| 1.089999999999914 | 0.835 | -0.517 | -1.028 |
| 1.094999999999914 | 0.807 | -0.515 | -1.027 |
| 1.099999999999914 | 0.78 | -0.513 | -1.026 |
| 1.104999999999914 | 0.755 | -0.511 | -1.026 |
| 1.109999999999914 | 0.73 | -0.509 | -1.025 |
| 1.114999999999914 | 0.707 | -0.507 | -1.024 |
| 1.119999999999914 | 0.684 | -0.505 | -1.024 |
| 1.124999999999914 | 0.663 | -0.503 | -1.023 |
| 1.129999999999914 | 0.642 | -0.501 | -1.022 |
| 1.134999999999913 | 0.622 | -0.499 | -1.021 |
| 1.139999999999913 | 0.603 | -0.497 | -1.021 |
| 1.144999999999913 | 0.584 | -0.495 | -1.02 |
| 1.149999999999913 | 0.566 | -0.492 | -1.019 |
| 1.154999999999913 | 0.548 | -0.49 | -1.018 |
| 1.159999999999913 | 0.531 | -0.488 | -1.018 |
| 1.164999999999913 | 0.515 | -0.486 | -1.017 |
| 1.169999999999913 | 0.499 | -0.484 | -1.016 |
| 1.174999999999913 | 0.483 | -0.481 | -1.015 |
| 1.179999999999912 | 0.468 | -0.479 | -1.015 |
| 1.184999999999912 | 0.453 | -0.477 | -1.014 |
| 1.189999999999912 | 0.438 | -0.475 | -1.013 |
| 1.194999999999912 | 0.424 | -0.472 | -1.012 |
| 1.199999999999912 | 0.41 | -0.47 | -1.011 |
| 1.204999999999912 | 0.397 | -0.468 | -1.011 |
| 1.209999999999912 | 0.384 | -0.465 | -1.01 |
| 1.214999999999912 | 0.371 | -0.463 | -1.009 |
| 1.219999999999912 | 0.358 | -0.46 | -1.008 |
| 1.224999999999911 | 0.346 | -0.458 | -1.007 |
| 1.229999999999911 | 0.334 | -0.456 | -1.007 |
| 1.234999999999911 | 0.322 | -0.453 | -1.006 |
| 1.239999999999911 | 0.31 | -0.451 | -1.005 |
| 1.244999999999911 | 0.299 | -0.448 | -1.004 |
| 1.249999999999911 | 0.288 | -0.445 | -1.003 |
| 1.254999999999911 | 0.277 | -0.443 | -1.002 |
| 1.259999999999911 | 0.266 | -0.44 | -1.002 |
| 1.264999999999911 | 0.255 | -0.438 | -1.001 |
| 1.269999999999911 | 0.245 | -0.435 | -1 |
| 1.27499999999991 | 0.235 | -0.432 | -0.999 |
| 1.27999999999991 | 0.224 | -0.43 | -0.998 |
| 1.28499999999991 | 0.214 | -0.427 | -0.997 |
| 1.28999999999991 | 0.205 | -0.424 | -0.996 |
| 1.29499999999991 | 0.195 | -0.421 | -0.996 |
| 1.29999999999991 | 0.186 | -0.419 | -0.995 |
| 1.30499999999991 | 0.176 | -0.416 | -0.994 |
| 1.30999999999991 | 0.167 | -0.413 | -0.993 |
| 1.31499999999991 | 0.158 | -0.41 | -0.992 |
| 1.319999999999909 | 0.149 | -0.407 | -0.991 |
| 1.324999999999909 | 0.14 | -0.404 | -0.99 |
| 1.329999999999909 | 0.131 | -0.401 | -0.989 |
| 1.334999999999909 | 0.123 | -0.398 | -0.988 |
| 1.339999999999909 | 0.114 | -0.395 | -0.987 |
| 1.344999999999909 | 0.106 | -0.392 | -0.986 |
| 1.349999999999909 | 0.098 | -0.389 | -0.985 |
| 1.354999999999909 | 0.09 | -0.386 | -0.985 |
| 1.359999999999909 | 0.081 | -0.383 | -0.984 |
| 1.364999999999908 | 0.074 | -0.38 | -0.983 |
| 1.369999999999908 | 0.066 | -0.376 | -0.982 |
| 1.374999999999908 | 0.058 | -0.373 | -0.981 |
| 1.379999999999908 | 0.05 | -0.37 | -0.98 |
| 1.384999999999908 | 0.043 | -0.367 | -0.979 |
| 1.389999999999908 | 0.035 | -0.363 | -0.978 |
| 1.394999999999908 | 0.028 | -0.36 | -0.977 |
| 1.399999999999908 | 0.02 | -0.356 | -0.976 |
| 1.404999999999908 | 0.013 | -0.353 | -0.975 |
| 1.409999999999908 | 0.006 | -0.35 | -0.974 |
| 1.414999999999907 | -0.001 | -0.346 | -0.973 |
| 1.419999999999907 | -0.008 | -0.342 | -0.972 |
| 1.424999999999907 | -0.015 | -0.339 | -0.971 |
| 1.429999999999907 | -0.022 | -0.335 | -0.97 |
| 1.434999999999907 | -0.029 | -0.332 | -0.969 |
| 1.439999999999907 | -0.036 | -0.328 | -0.968 |
| 1.444999999999907 | -0.042 | -0.324 | -0.967 |
| 1.449999999999907 | -0.049 | -0.32 | -0.966 |
| 1.454999999999907 | -0.055 | -0.316 | -0.965 |
| 1.459999999999906 | -0.062 | -0.313 | -0.963 |
| 1.464999999999906 | -0.068 | -0.309 | -0.962 |
| 1.469999999999906 | -0.075 | -0.305 | -0.961 |
| 1.474999999999906 | -0.081 | -0.301 | -0.96 |
| 1.479999999999906 | -0.087 | -0.297 | -0.959 |
| 1.484999999999906 | -0.093 | -0.292 | -0.958 |
| 1.489999999999906 | -0.099 | -0.288 | -0.957 |
| 1.494999999999906 | -0.106 | -0.284 | -0.956 |
| 1.499999999999906 | -0.112 | -0.28 | -0.955 |
| 1.504999999999906 | -0.118 | -0.275 | -0.954 |
| 1.509999999999905 | -0.123 | -0.271 | -0.953 |
| 1.514999999999905 | -0.129 | -0.267 | -0.951 |
| 1.519999999999905 | -0.135 | -0.262 | -0.95 |
| 1.524999999999905 | -0.141 | -0.258 | -0.949 |
| 1.529999999999905 | -0.147 | -0.253 | -0.948 |
| 1.534999999999905 | -0.152 | -0.248 | -0.947 |
| 1.539999999999905 | -0.158 | -0.244 | -0.946 |
| 1.544999999999905 | -0.164 | -0.239 | -0.945 |
| 1.549999999999905 | -0.169 | -0.234 | -0.943 |
| 1.554999999999904 | -0.175 | -0.229 | -0.942 |
| 1.559999999999904 | -0.18 | -0.224 | -0.941 |
| 1.564999999999904 | -0.186 | -0.219 | -0.94 |
| 1.569999999999904 | -0.191 | -0.214 | -0.939 |
| 1.574999999999904 | -0.196 | -0.209 | -0.937 |
| 1.579999999999904 | -0.202 | -0.204 | -0.936 |
| 1.584999999999904 | -0.207 | -0.199 | -0.935 |
| 1.589999999999904 | -0.212 | -0.193 | -0.934 |
| 1.594999999999904 | -0.217 | -0.188 | -0.933 |
| 1.599999999999903 | -0.222 | -0.182 | -0.931 |
| 1.604999999999903 | -0.227 | -0.177 | -0.93 |
| 1.609999999999903 | -0.233 | -0.171 | -0.929 |
| 1.614999999999903 | -0.238 | -0.165 | -0.928 |
| 1.619999999999903 | -0.243 | -0.159 | -0.926 |
| 1.624999999999903 | -0.248 | -0.154 | -0.925 |
| 1.629999999999903 | -0.252 | -0.147 | -0.924 |
| 1.634999999999903 | -0.257 | -0.141 | -0.922 |
| 1.639999999999903 | -0.262 | -0.135 | -0.921 |
| 1.644999999999902 | -0.267 | -0.129 | -0.92 |
| 1.649999999999902 | -0.272 | -0.122 | -0.918 |
| 1.654999999999902 | -0.277 | -0.116 | -0.917 |
| 1.659999999999902 | -0.281 | -0.109 | -0.916 |
| 1.664999999999902 | -0.286 | -0.103 | -0.915 |
| 1.669999999999902 | -0.291 | -0.096 | -0.913 |
| 1.674999999999902 | -0.295 | -0.089 | -0.912 |
| 1.679999999999902 | -0.3 | -0.082 | -0.91 |
| 1.684999999999902 | -0.305 | -0.075 | -0.909 |
| 1.689999999999901 | -0.309 | -0.067 | -0.908 |
| 1.694999999999901 | -0.314 | -0.06 | -0.906 |
| 1.699999999999901 | -0.318 | -0.052 | -0.905 |
| 1.704999999999901 | -0.323 | -0.044 | -0.904 |
| 1.709999999999901 | -0.327 | -0.037 | -0.902 |
| 1.714999999999901 | -0.332 | -0.029 | -0.901 |
| 1.719999999999901 | -0.336 | -0.02 | -0.899 |
| 1.724999999999901 | -0.34 | -0.012 | -0.898 |
| 1.729999999999901 | -0.345 | -0.004 | -0.896 |
| 1.734999999999901 | -0.349 | 0.005 | -0.895 |
| 1.7399999999999 | -0.353 | 0.014 | -0.894 |
| 1.7449999999999 | -0.358 | 0.023 | -0.892 |
| 1.7499999999999 | -0.362 | 0.032 | -0.891 |
| 1.7549999999999 | -0.366 | 0.042 | -0.889 |
| 1.7599999999999 | -0.37 | 0.051 | -0.888 |
| 1.7649999999999 | -0.375 | 0.061 | -0.886 |
| 1.7699999999999 | -0.379 | 0.071 | -0.885 |
| 1.7749999999999 | -0.383 | 0.082 | -0.883 |
| 1.7799999999999 | -0.387 | 0.092 | -0.882 |
| 1.784999999999899 | -0.391 | 0.103 | -0.88 |
| 1.789999999999899 | -0.395 | 0.114 | -0.879 |
| 1.794999999999899 | -0.399 | 0.126 | -0.877 |
| 1.799999999999899 | -0.403 | 0.137 | -0.875 |
| 1.804999999999899 | -0.407 | 0.149 | -0.874 |
| 1.809999999999899 | -0.411 | 0.162 | -0.872 |
| 1.814999999999899 | -0.415 | 0.174 | -0.871 |
| 1.819999999999899 | -0.419 | 0.187 | -0.869 |
| 1.824999999999899 | -0.423 | 0.201 | -0.868 |
| 1.829999999999899 | -0.427 | 0.215 | -0.866 |
| 1.834999999999898 | -0.431 | 0.229 | -0.864 |
| 1.839999999999898 | -0.435 | 0.244 | -0.863 |
| 1.844999999999898 | -0.439 | 0.259 | -0.861 |
| 1.849999999999898 | -0.442 | 0.275 | -0.859 |
| 1.854999999999898 | -0.446 | 0.291 | -0.858 |
| 1.859999999999898 | -0.45 | 0.308 | -0.856 |
| 1.864999999999898 | -0.454 | 0.325 | -0.854 |
| 1.869999999999898 | -0.458 | 0.343 | -0.853 |
| 1.874999999999898 | -0.461 | 0.362 | -0.851 |
| 1.879999999999897 | -0.465 | 0.382 | -0.849 |
| 1.884999999999897 | -0.469 | 0.403 | -0.848 |
| 1.889999999999897 | -0.472 | 0.424 | -0.846 |
| 1.894999999999897 | -0.476 | 0.447 | -0.844 |
| 1.899999999999897 | -0.48 | 0.471 | -0.842 |
| 1.904999999999897 | -0.483 | 0.496 | -0.841 |
| 1.909999999999897 | -0.487 | 0.522 | -0.839 |
| 1.914999999999897 | -0.491 | 0.55 | -0.837 |
| 1.919999999999897 | -0.494 | 0.58 | -0.835 |
| 1.924999999999897 | -0.498 | 0.611 | -0.833 |
| 1.929999999999896 | -0.501 | 0.645 | -0.831 |
| 1.934999999999896 | -0.505 | 0.682 | -0.83 |
| 1.939999999999896 | -0.508 | 0.721 | -0.828 |
| 1.944999999999896 | -0.512 | 0.764 | -0.826 |
| 1.949999999999896 | -0.515 | 0.811 | -0.824 |
| 1.954999999999896 | -0.519 | 0.863 | -0.822 |
| 1.959999999999896 | -0.522 | 0.921 | -0.82 |
| 1.964999999999896 | -0.526 | 0.987 | -0.818 |
| 1.969999999999896 | -0.529 | 1.064 | -0.816 |
| 1.974999999999895 | -0.532 | 1.154 | -0.815 |
| 1.979999999999895 | -0.536 | 1.265 | -0.813 |
| 1.984999999999895 | -0.539 | 1.409 | -0.811 |
| 1.989999999999895 | -0.543 | 1.611 | -0.809 |
| 1.994999999999895 | -0.546 | 1.957 | -0.807 |
| 1.999999999999895 | -0.549 | 14.249 | -0.805 |
| 2.004999999999895 | -0.553 | 1.955 | -0.803 |
| 2.009999999999895 | -0.556 | 1.608 | -0.801 |
| 2.014999999999895 | -0.559 | 1.405 | -0.799 |
| 2.019999999999895 | -0.563 | 1.26 | -0.797 |
| 2.024999999999895 | -0.566 | 1.148 | -0.795 |
| 2.029999999999895 | -0.569 | 1.056 | -0.792 |
| 2.034999999999894 | -0.572 | 0.979 | -0.79 |
| 2.039999999999894 | -0.576 | 0.911 | -0.788 |
| 2.044999999999894 | -0.579 | 0.852 | -0.786 |
| 2.049999999999894 | -0.582 | 0.799 | -0.784 |
| 2.054999999999894 | -0.585 | 0.75 | -0.782 |
| 2.059999999999894 | -0.588 | 0.706 | -0.78 |
| 2.064999999999894 | -0.592 | 0.665 | -0.778 |
| 2.069999999999894 | -0.595 | 0.628 | -0.775 |
| 2.074999999999894 | -0.598 | 0.593 | -0.773 |
| 2.079999999999893 | -0.601 | 0.56 | -0.771 |
| 2.084999999999893 | -0.604 | 0.529 | -0.769 |
| 2.089999999999893 | -0.607 | 0.5 | -0.766 |
| 2.094999999999893 | -0.61 | 0.472 | -0.764 |
| 2.099999999999893 | -0.613 | 0.446 | -0.762 |
| 2.104999999999893 | -0.616 | 0.421 | -0.76 |
| 2.109999999999893 | -0.619 | 0.397 | -0.757 |
| 2.114999999999893 | -0.623 | 0.374 | -0.755 |
| 2.119999999999893 | -0.626 | 0.352 | -0.753 |
| 2.124999999999893 | -0.629 | 0.331 | -0.75 |
| 2.129999999999892 | -0.632 | 0.311 | -0.748 |
| 2.134999999999892 | -0.635 | 0.291 | -0.746 |
| 2.139999999999892 | -0.638 | 0.273 | -0.743 |
| 2.144999999999892 | -0.641 | 0.255 | -0.741 |
| 2.149999999999892 | -0.644 | 0.237 | -0.738 |
| 2.154999999999892 | -0.647 | 0.22 | -0.736 |
| 2.159999999999892 | -0.649 | 0.204 | -0.733 |
| 2.164999999999892 | -0.652 | 0.188 | -0.731 |
| 2.169999999999892 | -0.655 | 0.172 | -0.728 |
| 2.174999999999891 | -0.658 | 0.157 | -0.726 |
| 2.179999999999891 | -0.661 | 0.142 | -0.723 |
| 2.184999999999891 | -0.664 | 0.128 | -0.721 |
| 2.189999999999891 | -0.667 | 0.114 | -0.718 |
| 2.194999999999891 | -0.67 | 0.1 | -0.715 |
| 2.199999999999891 | -0.673 | 0.087 | -0.713 |
| 2.204999999999891 | -0.676 | 0.074 | -0.71 |
| 2.209999999999891 | -0.678 | 0.062 | -0.707 |
| 2.214999999999891 | -0.681 | 0.049 | -0.705 |
| 2.21999999999989 | -0.684 | 0.037 | -0.702 |
| 2.22499999999989 | -0.687 | 0.025 | -0.699 |
| 2.22999999999989 | -0.69 | 0.014 | -0.697 |
| 2.23499999999989 | -0.693 | 0.002 | -0.694 |
| 2.23999999999989 | -0.695 | -0.009 | -0.691 |
| 2.24499999999989 | -0.698 | -0.02 | -0.688 |
| 2.24999999999989 | -0.701 | -0.03 | -0.685 |
| 2.25499999999989 | -0.704 | -0.041 | -0.682 |
| 2.25999999999989 | -0.706 | -0.051 | -0.68 |
| 2.26499999999989 | -0.709 | -0.061 | -0.677 |
| 2.269999999999889 | -0.712 | -0.071 | -0.674 |
| 2.274999999999889 | -0.715 | -0.081 | -0.671 |
| 2.279999999999889 | -0.717 | -0.09 | -0.668 |
| 2.284999999999889 | -0.72 | -0.1 | -0.665 |
| 2.289999999999889 | -0.723 | -0.109 | -0.662 |
| 2.294999999999889 | -0.725 | -0.118 | -0.659 |
| 2.299999999999889 | -0.728 | -0.127 | -0.656 |
| 2.304999999999889 | -0.731 | -0.136 | -0.652 |
| 2.309999999999889 | -0.733 | -0.145 | -0.649 |
| 2.314999999999888 | -0.736 | -0.153 | -0.646 |
| 2.319999999999888 | -0.739 | -0.162 | -0.643 |
| 2.324999999999888 | -0.741 | -0.17 | -0.64 |
| 2.329999999999888 | -0.744 | -0.178 | -0.636 |
| 2.334999999999888 | -0.747 | -0.187 | -0.633 |
| 2.339999999999888 | -0.749 | -0.195 | -0.63 |
| 2.344999999999888 | -0.752 | -0.202 | -0.627 |
| 2.349999999999888 | -0.755 | -0.21 | -0.623 |
| 2.354999999999888 | -0.757 | -0.218 | -0.62 |
| 2.359999999999887 | -0.76 | -0.225 | -0.616 |
| 2.364999999999887 | -0.762 | -0.233 | -0.613 |
| 2.369999999999887 | -0.765 | -0.24 | -0.609 |
| 2.374999999999887 | -0.767 | -0.248 | -0.606 |
| 2.379999999999887 | -0.77 | -0.255 | -0.602 |
| 2.384999999999887 | -0.773 | -0.262 | -0.599 |
| 2.389999999999887 | -0.775 | -0.269 | -0.595 |
| 2.394999999999887 | -0.778 | -0.276 | -0.591 |
| 2.399999999999887 | -0.78 | -0.283 | -0.588 |
| 2.404999999999887 | -0.783 | -0.289 | -0.584 |
| 2.409999999999886 | -0.785 | -0.296 | -0.58 |
| 2.414999999999886 | -0.788 | -0.303 | -0.577 |
| 2.419999999999886 | -0.79 | -0.309 | -0.573 |
| 2.424999999999886 | -0.793 | -0.316 | -0.569 |
| 2.429999999999886 | -0.795 | -0.322 | -0.565 |
| 2.434999999999886 | -0.798 | -0.329 | -0.561 |
| 2.439999999999886 | -0.8 | -0.335 | -0.557 |
| 2.444999999999886 | -0.803 | -0.341 | -0.553 |
| 2.449999999999886 | -0.805 | -0.347 | -0.549 |
| 2.454999999999885 | -0.807 | -0.353 | -0.545 |
| 2.459999999999885 | -0.81 | -0.359 | -0.541 |
| 2.464999999999885 | -0.812 | -0.365 | -0.536 |
| 2.469999999999885 | -0.815 | -0.371 | -0.532 |
| 2.474999999999885 | -0.817 | -0.377 | -0.528 |
| 2.479999999999885 | -0.82 | -0.383 | -0.524 |
| 2.484999999999885 | -0.822 | -0.389 | -0.519 |
| 2.489999999999885 | -0.824 | -0.394 | -0.515 |
| 2.494999999999885 | -0.827 | -0.4 | -0.51 |
| 2.499999999999884 | -0.829 | -0.405 | -0.506 |
| 2.504999999999884 | -0.831 | -0.411 | -0.501 |
| 2.509999999999884 | -0.834 | -0.416 | -0.497 |
| 2.514999999999884 | -0.836 | -0.422 | -0.492 |
| 2.519999999999884 | -0.839 | -0.427 | -0.487 |
| 2.524999999999884 | -0.841 | -0.433 | -0.482 |
| 2.529999999999884 | -0.843 | -0.438 | -0.478 |
| 2.534999999999884 | -0.846 | -0.443 | -0.473 |
| 2.539999999999884 | -0.848 | -0.448 | -0.468 |
| 2.544999999999884 | -0.85 | -0.454 | -0.463 |
| 2.549999999999883 | -0.853 | -0.459 | -0.458 |
| 2.554999999999883 | -0.855 | -0.464 | -0.453 |
| 2.559999999999883 | -0.857 | -0.469 | -0.447 |
| 2.564999999999883 | -0.86 | -0.474 | -0.442 |
| 2.569999999999883 | -0.862 | -0.479 | -0.437 |
| 2.574999999999883 | -0.864 | -0.484 | -0.431 |
| 2.579999999999883 | -0.866 | -0.488 | -0.426 |
| 2.584999999999883 | -0.869 | -0.493 | -0.42 |
| 2.589999999999883 | -0.871 | -0.498 | -0.415 |
| 2.594999999999882 | -0.873 | -0.503 | -0.409 |
| 2.599999999999882 | -0.875 | -0.508 | -0.403 |
| 2.604999999999882 | -0.878 | -0.512 | -0.397 |
| 2.609999999999882 | -0.88 | -0.517 | -0.391 |
| 2.614999999999882 | -0.882 | -0.522 | -0.385 |
| 2.619999999999882 | -0.884 | -0.526 | -0.379 |
| 2.624999999999882 | -0.887 | -0.531 | -0.373 |
| 2.629999999999882 | -0.889 | -0.535 | -0.367 |
| 2.634999999999882 | -0.891 | -0.54 | -0.361 |
| 2.639999999999881 | -0.893 | -0.544 | -0.354 |
| 2.644999999999881 | -0.896 | -0.549 | -0.348 |
| 2.649999999999881 | -0.898 | -0.553 | -0.341 |
| 2.654999999999881 | -0.9 | -0.557 | -0.334 |
| 2.659999999999881 | -0.902 | -0.562 | -0.327 |
| 2.664999999999881 | -0.904 | -0.566 | -0.32 |
| 2.669999999999881 | -0.907 | -0.57 | -0.313 |
| 2.674999999999881 | -0.909 | -0.575 | -0.306 |
| 2.679999999999881 | -0.911 | -0.579 | -0.299 |
| 2.68499999999988 | -0.913 | -0.583 | -0.291 |
| 2.68999999999988 | -0.915 | -0.587 | -0.284 |
| 2.69499999999988 | -0.917 | -0.591 | -0.276 |
| 2.69999999999988 | -0.919 | -0.595 | -0.268 |
| 2.70499999999988 | -0.922 | -0.6 | -0.26 |
| 2.70999999999988 | -0.924 | -0.604 | -0.252 |
| 2.71499999999988 | -0.926 | -0.608 | -0.244 |
| 2.71999999999988 | -0.928 | -0.612 | -0.236 |
| 2.72499999999988 | -0.93 | -0.616 | -0.227 |
| 2.72999999999988 | -0.932 | -0.62 | -0.218 |
| 2.734999999999879 | -0.934 | -0.624 | -0.209 |
| 2.739999999999879 | -0.936 | -0.627 | -0.2 |
| 2.744999999999879 | -0.939 | -0.631 | -0.191 |
| 2.749999999999879 | -0.941 | -0.635 | -0.181 |
| 2.754999999999879 | -0.943 | -0.639 | -0.172 |
| 2.759999999999879 | -0.945 | -0.643 | -0.162 |
| 2.764999999999879 | -0.947 | -0.647 | -0.152 |
| 2.769999999999879 | -0.949 | -0.65 | -0.141 |
| 2.774999999999879 | -0.951 | -0.654 | -0.131 |
| 2.779999999999878 | -0.953 | -0.658 | -0.12 |
| 2.784999999999878 | -0.955 | -0.662 | -0.109 |
| 2.789999999999878 | -0.957 | -0.665 | -0.098 |
| 2.794999999999878 | -0.959 | -0.669 | -0.086 |
| 2.799999999999878 | -0.961 | -0.673 | -0.074 |
| 2.804999999999878 | -0.963 | -0.676 | -0.062 |
| 2.809999999999878 | -0.965 | -0.68 | -0.049 |
| 2.814999999999878 | -0.968 | -0.684 | -0.037 |
| 2.819999999999878 | -0.97 | -0.687 | -0.023 |
| 2.824999999999878 | -0.972 | -0.691 | -0.01 |
| 2.829999999999877 | -0.974 | -0.694 | 0.004 |
| 2.834999999999877 | -0.976 | -0.698 | 0.019 |
| 2.839999999999877 | -0.978 | -0.701 | 0.034 |
| 2.844999999999877 | -0.98 | -0.705 | 0.049 |
| 2.849999999999877 | -0.982 | -0.708 | 0.065 |
| 2.854999999999877 | -0.984 | -0.712 | 0.082 |
| 2.859999999999877 | -0.986 | -0.715 | 0.099 |
| 2.864999999999877 | -0.988 | -0.719 | 0.117 |
| 2.869999999999877 | -0.99 | -0.722 | 0.135 |
| 2.874999999999876 | -0.992 | -0.725 | 0.154 |
| 2.879999999999876 | -0.994 | -0.729 | 0.174 |
| 2.884999999999876 | -0.996 | -0.732 | 0.195 |
| 2.889999999999876 | -0.997 | -0.735 | 0.217 |
| 2.894999999999876 | -0.999 | -0.739 | 0.24 |
| 2.899999999999876 | -1.001 | -0.742 | 0.264 |
| 2.904999999999876 | -1.003 | -0.745 | 0.289 |
| 2.909999999999876 | -1.005 | -0.748 | 0.316 |
| 2.914999999999876 | -1.007 | -0.752 | 0.344 |
| 2.919999999999876 | -1.009 | -0.755 | 0.374 |
| 2.924999999999875 | -1.011 | -0.758 | 0.406 |
| 2.929999999999875 | -1.013 | -0.761 | 0.44 |
| 2.934999999999875 | -1.015 | -0.765 | 0.476 |
| 2.939999999999875 | -1.017 | -0.768 | 0.516 |
| 2.944999999999875 | -1.019 | -0.771 | 0.559 |
| 2.949999999999875 | -1.021 | -0.774 | 0.606 |
| 2.954999999999875 | -1.023 | -0.777 | 0.658 |
| 2.959999999999875 | -1.025 | -0.78 | 0.717 |
| 2.964999999999875 | -1.026 | -0.783 | 0.783 |
| 2.969999999999874 | -1.028 | -0.786 | 0.86 |
| 2.974999999999874 | -1.03 | -0.79 | 0.951 |
| 2.979999999999874 | -1.032 | -0.793 | 1.062 |
| 2.984999999999874 | -1.034 | -0.796 | 1.205 |
| 2.989999999999874 | -1.036 | -0.799 | 1.408 |
| 2.994999999999874 | -1.038 | -0.802 | 1.754 |
| 2.999999999999874 | -1.04 | -0.805 | 13.955 |
| 3.004999999999874 | -1.042 | -0.808 | 1.753 |
| 3.009999999999874 | -1.043 | -0.811 | 1.406 |
| 3.014999999999874 | -1.045 | -0.814 | 1.203 |
| 3.019999999999873 | -1.047 | -0.817 | 1.058 |
| 3.024999999999873 | -1.049 | -0.82 | 0.946 |
| 3.029999999999873 | -1.051 | -0.822 | 0.855 |
| 3.034999999999873 | -1.053 | -0.825 | 0.777 |
| 3.039999999999873 | -1.055 | -0.828 | 0.71 |
| 3.044999999999873 | -1.056 | -0.831 | 0.651 |
| 3.049999999999873 | -1.058 | -0.834 | 0.598 |
| 3.054999999999873 | -1.06 | -0.837 | 0.55 |
| 3.059999999999873 | -1.062 | -0.84 | 0.506 |
| 3.064999999999872 | -1.064 | -0.843 | 0.465 |
| 3.069999999999872 | -1.066 | -0.845 | 0.428 |
| 3.074999999999872 | -1.067 | -0.848 | 0.393 |
| 3.079999999999872 | -1.069 | -0.851 | 0.36 |
| 3.084999999999872 | -1.071 | -0.854 | 0.33 |
| 3.089999999999872 | -1.073 | -0.857 | 0.301 |
| 3.094999999999872 | -1.075 | -0.86 | 0.273 |
| 3.099999999999872 | -1.076 | -0.862 | 0.247 |
| 3.104999999999872 | -1.078 | -0.865 | 0.222 |
| 3.109999999999872 | -1.08 | -0.868 | 0.199 |
| 3.114999999999871 | -1.082 | -0.871 | 0.176 |
| 3.119999999999871 | -1.084 | -0.873 | 0.154 |
| 3.124999999999871 | -1.085 | -0.876 | 0.134 |
| 3.129999999999871 | -1.087 | -0.879 | 0.114 |
| 3.134999999999871 | -1.089 | -0.881 | 0.094 |
| 3.139999999999871 | -1.091 | -0.884 | 0.076 |
| 3.144999999999871 | -1.093 | -0.887 | 0.058 |
| 3.149999999999871 | -1.094 | -0.889 | 0.04 |
| 3.154999999999871 | -1.096 | -0.892 | 0.024 |
| 3.15999999999987 | -1.098 | -0.895 | 0.007 |
| 3.16499999999987 | -1.1 | -0.897 | -0.009 |
| 3.16999999999987 | -1.101 | -0.9 | -0.024 |
| 3.17499999999987 | -1.103 | -0.903 | -0.039 |
| 3.17999999999987 | -1.105 | -0.905 | -0.053 |
| 3.18499999999987 | -1.107 | -0.908 | -0.067 |
| 3.18999999999987 | -1.108 | -0.91 | -0.081 |
| 3.19499999999987 | -1.11 | -0.913 | -0.094 |
| 3.19999999999987 | -1.112 | -0.915 | -0.108 |
| 3.204999999999869 | -1.114 | -0.918 | -0.12 |
| 3.209999999999869 | -1.115 | -0.921 | -0.133 |
| 3.214999999999869 | -1.117 | -0.923 | -0.145 |
| 3.219999999999869 | -1.119 | -0.926 | -0.157 |
| 3.224999999999869 | -1.12 | -0.928 | -0.168 |
| 3.229999999999869 | -1.122 | -0.931 | -0.18 |
| 3.234999999999869 | -1.124 | -0.933 | -0.191 |
| 3.239999999999869 | -1.126 | -0.936 | -0.202 |
| 3.244999999999869 | -1.127 | -0.938 | -0.213 |
| 3.249999999999869 | -1.129 | -0.941 | -0.223 |
| 3.254999999999868 | -1.131 | -0.943 | -0.233 |
| 3.259999999999868 | -1.132 | -0.946 | -0.244 |
| 3.264999999999868 | -1.134 | -0.948 | -0.253 |
| 3.269999999999868 | -1.136 | -0.951 | -0.263 |
| 3.274999999999868 | -1.137 | -0.953 | -0.273 |
| 3.279999999999868 | -1.139 | -0.955 | -0.282 |
| 3.284999999999868 | -1.141 | -0.958 | -0.291 |
| 3.289999999999868 | -1.142 | -0.96 | -0.301 |
| 3.294999999999868 | -1.144 | -0.963 | -0.309 |
| 3.299999999999867 | -1.146 | -0.965 | -0.318 |
| 3.304999999999867 | -1.147 | -0.967 | -0.327 |
| 3.309999999999867 | -1.149 | -0.97 | -0.335 |
| 3.314999999999867 | -1.151 | -0.972 | -0.344 |
| 3.319999999999867 | -1.152 | -0.975 | -0.352 |
| 3.324999999999867 | -1.154 | -0.977 | -0.36 |
| 3.329999999999867 | -1.156 | -0.979 | -0.368 |
| 3.334999999999867 | -1.157 | -0.982 | -0.376 |
| 3.339999999999867 | -1.159 | -0.984 | -0.384 |
| 3.344999999999866 | -1.161 | -0.986 | -0.392 |
| 3.349999999999866 | -1.162 | -0.989 | -0.399 |
| 3.354999999999866 | -1.164 | -0.991 | -0.407 |
| 3.359999999999866 | -1.166 | -0.993 | -0.414 |
| 3.364999999999866 | -1.167 | -0.996 | -0.421 |
| 3.369999999999866 | -1.169 | -0.998 | -0.429 |
| 3.374999999999866 | -1.17 | -1 | -0.436 |
| 3.379999999999866 | -1.172 | -1.002 | -0.443 |
| 3.384999999999866 | -1.174 | -1.005 | -0.45 |
| 3.389999999999866 | -1.175 | -1.007 | -0.457 |
| 3.394999999999865 | -1.177 | -1.009 | -0.463 |
| 3.399999999999865 | -1.179 | -1.011 | -0.47 |
| 3.404999999999865 | -1.18 | -1.014 | -0.477 |
| 3.409999999999865 | -1.182 | -1.016 | -0.483 |
| 3.414999999999865 | -1.183 | -1.018 | -0.49 |
| 3.419999999999865 | -1.185 | -1.02 | -0.496 |
| 3.424999999999865 | -1.187 | -1.023 | -0.502 |
| 3.429999999999865 | -1.188 | -1.025 | -0.509 |
| 3.434999999999865 | -1.19 | -1.027 | -0.515 |
| 3.439999999999864 | -1.191 | -1.029 | -0.521 |
| 3.444999999999864 | -1.193 | -1.031 | -0.527 |
| 3.449999999999864 | -1.194 | -1.034 | -0.533 |
| 3.454999999999864 | -1.196 | -1.036 | -0.539 |
| 3.459999999999864 | -1.198 | -1.038 | -0.545 |
| 3.464999999999864 | -1.199 | -1.04 | -0.55 |
| 3.469999999999864 | -1.201 | -1.042 | -0.556 |
| 3.474999999999864 | -1.202 | -1.044 | -0.562 |
| 3.479999999999864 | -1.204 | -1.047 | -0.567 |
| 3.484999999999864 | -1.206 | -1.049 | -0.573 |
| 3.489999999999863 | -1.207 | -1.051 | -0.578 |
| 3.494999999999863 | -1.209 | -1.053 | -0.584 |
| 3.499999999999863 | -1.21 | -1.055 | -0.589 |
| 3.504999999999863 | -1.212 | -1.057 | -0.595 |
| 3.509999999999863 | -1.213 | -1.059 | -0.6 |
| 3.514999999999863 | -1.215 | -1.061 | -0.605 |
| 3.519999999999863 | -1.216 | -1.064 | -0.61 |
| 3.524999999999863 | -1.218 | -1.066 | -0.616 |
| 3.529999999999863 | -1.219 | -1.068 | -0.621 |
| 3.534999999999862 | -1.221 | -1.07 | -0.626 |
| 3.539999999999862 | -1.223 | -1.072 | -0.631 |
| 3.544999999999862 | -1.224 | -1.074 | -0.636 |
| 3.549999999999862 | -1.226 | -1.076 | -0.641 |
| 3.554999999999862 | -1.227 | -1.078 | -0.646 |
| 3.559999999999862 | -1.229 | -1.08 | -0.651 |
| 3.564999999999862 | -1.23 | -1.082 | -0.655 |
| 3.569999999999862 | -1.232 | -1.084 | -0.66 |
| 3.574999999999862 | -1.233 | -1.086 | -0.665 |
| 3.579999999999862 | -1.235 | -1.088 | -0.67 |
| 3.584999999999861 | -1.236 | -1.09 | -0.674 |
| 3.589999999999861 | -1.238 | -1.092 | -0.679 |
| 3.594999999999861 | -1.239 | -1.094 | -0.684 |
| 3.599999999999861 | -1.241 | -1.096 | -0.688 |
| 3.604999999999861 | -1.242 | -1.098 | -0.693 |
| 3.609999999999861 | -1.244 | -1.1 | -0.697 |
| 3.614999999999861 | -1.245 | -1.102 | -0.702 |
| 3.619999999999861 | -1.247 | -1.104 | -0.706 |
| 3.62499999999986 | -1.248 | -1.106 | -0.71 |
| 3.62999999999986 | -1.25 | -1.108 | -0.715 |
| 3.63499999999986 | -1.251 | -1.11 | -0.719 |
| 3.63999999999986 | -1.253 | -1.112 | -0.723 |
| 3.64499999999986 | -1.254 | -1.114 | -0.728 |
| 3.64999999999986 | -1.256 | -1.116 | -0.732 |
| 3.65499999999986 | -1.257 | -1.118 | -0.736 |
| 3.65999999999986 | -1.259 | -1.12 | -0.74 |
| 3.66499999999986 | -1.26 | -1.122 | -0.744 |
| 3.669999999999859 | -1.262 | -1.124 | -0.749 |
| 3.674999999999859 | -1.263 | -1.126 | -0.753 |
| 3.679999999999859 | -1.265 | -1.128 | -0.757 |
| 3.684999999999859 | -1.266 | -1.13 | -0.761 |
| 3.689999999999859 | -1.267 | -1.132 | -0.765 |
| 3.694999999999859 | -1.269 | -1.134 | -0.769 |
| 3.699999999999859 | -1.27 | -1.136 | -0.773 |
| 3.704999999999859 | -1.272 | -1.137 | -0.777 |
| 3.709999999999859 | -1.273 | -1.139 | -0.781 |
| 3.714999999999859 | -1.275 | -1.141 | -0.784 |
| 3.719999999999858 | -1.276 | -1.143 | -0.788 |
| 3.724999999999858 | -1.278 | -1.145 | -0.792 |
| 3.729999999999858 | -1.279 | -1.147 | -0.796 |
| 3.734999999999858 | -1.281 | -1.149 | -0.8 |
| 3.739999999999858 | -1.282 | -1.151 | -0.803 |
| 3.744999999999858 | -1.283 | -1.153 | -0.807 |
| 3.749999999999858 | -1.285 | -1.154 | -0.811 |
| 3.754999999999858 | -1.286 | -1.156 | -0.815 |
| 3.759999999999858 | -1.288 | -1.158 | -0.818 |
| 3.764999999999857 | -1.289 | -1.16 | -0.822 |
| 3.769999999999857 | -1.291 | -1.162 | -0.826 |
| 3.774999999999857 | -1.292 | -1.164 | -0.829 |
| 3.779999999999857 | -1.293 | -1.166 | -0.833 |
| 3.784999999999857 | -1.295 | -1.167 | -0.836 |
| 3.789999999999857 | -1.296 | -1.169 | -0.84 |
| 3.794999999999857 | -1.298 | -1.171 | -0.843 |
| 3.799999999999857 | -1.299 | -1.173 | -0.847 |
| 3.804999999999857 | -1.301 | -1.175 | -0.85 |
| 3.809999999999857 | -1.302 | -1.176 | -0.854 |
| 3.814999999999856 | -1.303 | -1.178 | -0.857 |
| 3.819999999999856 | -1.305 | -1.18 | -0.861 |
| 3.824999999999856 | -1.306 | -1.182 | -0.864 |
| 3.829999999999856 | -1.308 | -1.184 | -0.867 |
| 3.834999999999856 | -1.309 | -1.185 | -0.871 |
| 3.839999999999856 | -1.31 | -1.187 | -0.874 |
| 3.844999999999856 | -1.312 | -1.189 | -0.878 |
| 3.849999999999856 | -1.313 | -1.191 | -0.881 |
| 3.854999999999856 | -1.315 | -1.193 | -0.884 |
| 3.859999999999855 | -1.316 | -1.194 | -0.887 |
| 3.864999999999855 | -1.317 | -1.196 | -0.891 |
| 3.869999999999855 | -1.319 | -1.198 | -0.894 |
| 3.874999999999855 | -1.32 | -1.2 | -0.897 |
| 3.879999999999855 | -1.321 | -1.201 | -0.9 |
| 3.884999999999855 | -1.323 | -1.203 | -0.904 |
| 3.889999999999855 | -1.324 | -1.205 | -0.907 |
| 3.894999999999855 | -1.326 | -1.207 | -0.91 |
| 3.899999999999855 | -1.327 | -1.208 | -0.913 |
| 3.904999999999855 | -1.328 | -1.21 | -0.916 |
| 3.909999999999854 | -1.33 | -1.212 | -0.919 |
| 3.914999999999854 | -1.331 | -1.214 | -0.922 |
| 3.919999999999854 | -1.332 | -1.215 | -0.926 |
| 3.924999999999854 | -1.334 | -1.217 | -0.929 |
| 3.929999999999854 | -1.335 | -1.219 | -0.932 |
| 3.934999999999854 | -1.337 | -1.22 | -0.935 |
| 3.939999999999854 | -1.338 | -1.222 | -0.938 |
| 3.944999999999854 | -1.339 | -1.224 | -0.941 |
| 3.949999999999854 | -1.341 | -1.226 | -0.944 |
| 3.954999999999853 | -1.342 | -1.227 | -0.947 |
| 3.959999999999853 | -1.343 | -1.229 | -0.95 |
| 3.964999999999853 | -1.345 | -1.231 | -0.953 |
| 3.969999999999853 | -1.346 | -1.232 | -0.956 |
| 3.974999999999853 | -1.347 | -1.234 | -0.959 |
| 3.979999999999853 | -1.349 | -1.236 | -0.961 |
| 3.984999999999853 | -1.35 | -1.237 | -0.964 |
| 3.989999999999853 | -1.351 | -1.239 | -0.967 |
| 3.994999999999853 | -1.353 | -1.241 | -0.97 |
| 3.999999999999853 | -1.354 | -1.242 | -0.973 |
| 4.004999999999852 | -1.355 | -1.244 | -0.976 |
| 4.009999999999852 | -1.357 | -1.246 | -0.979 |
| 4.014999999999852 | -1.358 | -1.247 | -0.981 |
| 4.019999999999852 | -1.359 | -1.249 | -0.984 |
| 4.024999999999852 | -1.361 | -1.251 | -0.987 |
| 4.029999999999852 | -1.362 | -1.252 | -0.99 |
| 4.034999999999852 | -1.363 | -1.254 | -0.993 |
| 4.039999999999851 | -1.365 | -1.256 | -0.995 |
| 4.044999999999852 | -1.366 | -1.257 | -0.998 |
| 4.049999999999851 | -1.367 | -1.259 | -1.001 |
| 4.054999999999851 | -1.369 | -1.261 | -1.004 |
| 4.059999999999851 | -1.37 | -1.262 | -1.006 |
| 4.064999999999851 | -1.371 | -1.264 | -1.009 |
| 4.069999999999851 | -1.373 | -1.265 | -1.012 |
| 4.074999999999851 | -1.374 | -1.267 | -1.014 |
| 4.07999999999985 | -1.375 | -1.269 | -1.017 |
| 4.084999999999851 | -1.376 | -1.27 | -1.02 |
| 4.08999999999985 | -1.378 | -1.272 | -1.022 |
| 4.094999999999851 | -1.379 | -1.274 | -1.025 |
| 4.09999999999985 | -1.38 | -1.275 | -1.028 |
| 4.10499999999985 | -1.382 | -1.277 | -1.03 |
| 4.10999999999985 | -1.383 | -1.278 | -1.033 |
| 4.11499999999985 | -1.384 | -1.28 | -1.036 |
| 4.11999999999985 | -1.385 | -1.281 | -1.038 |
| 4.12499999999985 | -1.387 | -1.283 | -1.041 |
| 4.12999999999985 | -1.388 | -1.285 | -1.043 |
| 4.13499999999985 | -1.389 | -1.286 | -1.046 |
| 4.13999999999985 | -1.391 | -1.288 | -1.048 |
| 4.144999999999849 | -1.392 | -1.289 | -1.051 |
| 4.14999999999985 | -1.393 | -1.291 | -1.053 |
| 4.154999999999849 | -1.394 | -1.293 | -1.056 |
| 4.15999999999985 | -1.396 | -1.294 | -1.058 |
| 4.164999999999849 | -1.397 | -1.296 | -1.061 |
| 4.169999999999849 | -1.398 | -1.297 | -1.063 |
| 4.174999999999849 | -1.4 | -1.299 | -1.066 |
| 4.179999999999848 | -1.401 | -1.3 | -1.068 |
| 4.184999999999849 | -1.402 | -1.302 | -1.071 |
| 4.189999999999848 | -1.403 | -1.303 | -1.073 |
| 4.194999999999848 | -1.405 | -1.305 | -1.076 |
| 4.199999999999848 | -1.406 | -1.307 | -1.078 |
| 4.204999999999848 | -1.407 | -1.308 | -1.081 |
| 4.209999999999848 | -1.408 | -1.31 | -1.083 |
| 4.214999999999848 | -1.41 | -1.311 | -1.085 |
| 4.219999999999847 | -1.411 | -1.313 | -1.088 |
| 4.224999999999848 | -1.412 | -1.314 | -1.09 |
| 4.229999999999847 | -1.413 | -1.316 | -1.093 |
| 4.234999999999847 | -1.415 | -1.317 | -1.095 |
| 4.239999999999847 | -1.416 | -1.319 | -1.097 |
| 4.244999999999847 | -1.417 | -1.32 | -1.1 |
| 4.249999999999847 | -1.418 | -1.322 | -1.102 |
| 4.254999999999847 | -1.42 | -1.323 | -1.104 |
| 4.259999999999846 | -1.421 | -1.325 | -1.107 |
| 4.264999999999847 | -1.422 | -1.326 | -1.109 |
| 4.269999999999846 | -1.423 | -1.328 | -1.111 |
| 4.274999999999846 | -1.425 | -1.329 | -1.114 |
| 4.279999999999846 | -1.426 | -1.331 | -1.116 |
| 4.284999999999846 | -1.427 | -1.332 | -1.118 |
| 4.289999999999846 | -1.428 | -1.334 | -1.121 |
| 4.294999999999846 | -1.43 | -1.335 | -1.123 |
| 4.299999999999846 | -1.431 | -1.337 | -1.125 |
| 4.304999999999846 | -1.432 | -1.338 | -1.127 |
| 4.309999999999845 | -1.433 | -1.34 | -1.13 |
| 4.314999999999846 | -1.434 | -1.341 | -1.132 |
| 4.319999999999845 | -1.436 | -1.343 | -1.134 |
| 4.324999999999846 | -1.437 | -1.344 | -1.136 |
| 4.329999999999845 | -1.438 | -1.346 | -1.139 |
| 4.334999999999845 | -1.439 | -1.347 | -1.141 |
| 4.339999999999845 | -1.441 | -1.349 | -1.143 |
| 4.344999999999845 | -1.442 | -1.35 | -1.145 |
| 4.349999999999845 | -1.443 | -1.351 | -1.147 |
| 4.354999999999845 | -1.444 | -1.353 | -1.15 |
| 4.359999999999844 | -1.445 | -1.354 | -1.152 |
| 4.364999999999845 | -1.447 | -1.356 | -1.154 |
| 4.369999999999844 | -1.448 | -1.357 | -1.156 |
| 4.374999999999844 | -1.449 | -1.359 | -1.158 |
| 4.379999999999844 | -1.45 | -1.36 | -1.16 |
| 4.384999999999844 | -1.451 | -1.362 | -1.163 |
| 4.389999999999844 | -1.453 | -1.363 | -1.165 |
| 4.394999999999844 | -1.454 | -1.364 | -1.167 |
| 4.399999999999844 | -1.455 | -1.366 | -1.169 |
| 4.404999999999844 | -1.456 | -1.367 | -1.171 |
| 4.409999999999843 | -1.457 | -1.369 | -1.173 |
| 4.414999999999844 | -1.459 | -1.37 | -1.175 |
| 4.419999999999843 | -1.46 | -1.372 | -1.177 |
| 4.424999999999843 | -1.461 | -1.373 | -1.18 |
| 4.429999999999843 | -1.462 | -1.374 | -1.182 |
| 4.434999999999843 | -1.463 | -1.376 | -1.184 |
| 4.439999999999843 | -1.465 | -1.377 | -1.186 |
| 4.444999999999843 | -1.466 | -1.379 | -1.188 |
| 4.449999999999842 | -1.467 | -1.38 | -1.19 |
| 4.454999999999843 | -1.468 | -1.381 | -1.192 |
| 4.459999999999842 | -1.469 | -1.383 | -1.194 |
| 4.464999999999843 | -1.471 | -1.384 | -1.196 |
| 4.469999999999842 | -1.472 | -1.386 | -1.198 |
| 4.474999999999842 | -1.473 | -1.387 | -1.2 |
| 4.479999999999842 | -1.474 | -1.388 | -1.202 |
| 4.484999999999842 | -1.475 | -1.39 | -1.204 |
| 4.489999999999842 | -1.476 | -1.391 | -1.206 |
| 4.494999999999842 | -1.478 | -1.393 | -1.208 |
| 4.499999999999841 | -1.479 | -1.394 | -1.21 |
| 4.504999999999842 | -1.48 | -1.395 | -1.212 |
| 4.509999999999841 | -1.481 | -1.397 | -1.214 |
| 4.514999999999842 | -1.482 | -1.398 | -1.216 |
| 4.519999999999841 | -1.483 | -1.4 | -1.218 |
| 4.524999999999841 | -1.485 | -1.401 | -1.22 |
| 4.529999999999841 | -1.486 | -1.402 | -1.222 |
| 4.534999999999841 | -1.487 | -1.404 | -1.224 |
| 4.53999999999984 | -1.488 | -1.405 | -1.226 |
| 4.544999999999841 | -1.489 | -1.406 | -1.228 |
| 4.54999999999984 | -1.49 | -1.408 | -1.23 |
| 4.554999999999841 | -1.492 | -1.409 | -1.232 |
| 4.55999999999984 | -1.493 | -1.41 | -1.234 |
| 4.564999999999841 | -1.494 | -1.412 | -1.236 |
| 4.56999999999984 | -1.495 | -1.413 | -1.238 |
| 4.57499999999984 | -1.496 | -1.415 | -1.24 |
| 4.57999999999984 | -1.497 | -1.416 | -1.241 |
| 4.58499999999984 | -1.498 | -1.417 | -1.243 |
| 4.58999999999984 | -1.5 | -1.419 | -1.245 |
| 4.59499999999984 | -1.501 | -1.42 | -1.247 |
| 4.59999999999984 | -1.502 | -1.421 | -1.249 |
| 4.60499999999984 | -1.503 | -1.423 | -1.251 |
| 4.60999999999984 | -1.504 | -1.424 | -1.253 |
| 4.614999999999839 | -1.505 | -1.425 | -1.255 |
| 4.61999999999984 | -1.506 | -1.427 | -1.257 |
| 4.624999999999839 | -1.508 | -1.428 | -1.258 |
| 4.62999999999984 | -1.509 | -1.429 | -1.26 |
| 4.634999999999839 | -1.51 | -1.431 | -1.262 |
| 4.639999999999838 | -1.511 | -1.432 | -1.264 |
| 4.644999999999839 | -1.512 | -1.433 | -1.266 |
| 4.649999999999838 | -1.513 | -1.435 | -1.268 |
| 4.654999999999839 | -1.514 | -1.436 | -1.27 |
| 4.659999999999838 | -1.515 | -1.437 | -1.271 |
| 4.664999999999838 | -1.517 | -1.439 | -1.273 |
| 4.669999999999838 | -1.518 | -1.44 | -1.275 |
| 4.674999999999838 | -1.519 | -1.441 | -1.277 |
| 4.679999999999837 | -1.52 | -1.442 | -1.279 |
| 4.684999999999838 | -1.521 | -1.444 | -1.281 |
| 4.689999999999837 | -1.522 | -1.445 | -1.282 |
| 4.694999999999838 | -1.523 | -1.446 | -1.284 |
| 4.699999999999837 | -1.524 | -1.448 | -1.286 |
| 4.704999999999837 | -1.526 | -1.449 | -1.288 |
| 4.709999999999837 | -1.527 | -1.45 | -1.29 |
| 4.714999999999837 | -1.528 | -1.452 | -1.291 |
| 4.719999999999837 | -1.529 | -1.453 | -1.293 |
| 4.724999999999837 | -1.53 | -1.454 | -1.295 |
| 4.729999999999836 | -1.531 | -1.455 | -1.297 |
| 4.734999999999836 | -1.532 | -1.457 | -1.298 |
| 4.739999999999836 | -1.533 | -1.458 | -1.3 |
| 4.744999999999836 | -1.534 | -1.459 | -1.302 |
| 4.749999999999836 | -1.535 | -1.461 | -1.304 |
| 4.754999999999836 | -1.537 | -1.462 | -1.305 |
| 4.759999999999836 | -1.538 | -1.463 | -1.307 |
| 4.764999999999836 | -1.539 | -1.464 | -1.309 |
| 4.769999999999836 | -1.54 | -1.466 | -1.311 |
| 4.774999999999835 | -1.541 | -1.467 | -1.312 |
| 4.779999999999835 | -1.542 | -1.468 | -1.314 |
| 4.784999999999835 | -1.543 | -1.469 | -1.316 |
| 4.789999999999835 | -1.544 | -1.471 | -1.318 |
| 4.794999999999835 | -1.545 | -1.472 | -1.319 |
| 4.799999999999835 | -1.546 | -1.473 | -1.321 |
| 4.804999999999835 | -1.548 | -1.475 | -1.323 |
| 4.809999999999835 | -1.549 | -1.476 | -1.324 |
| 4.814999999999835 | -1.55 | -1.477 | -1.326 |
| 4.819999999999835 | -1.551 | -1.478 | -1.328 |
| 4.824999999999835 | -1.552 | -1.48 | -1.329 |
| 4.829999999999834 | -1.553 | -1.481 | -1.331 |
| 4.834999999999834 | -1.554 | -1.482 | -1.333 |
| 4.839999999999834 | -1.555 | -1.483 | -1.335 |
| 4.844999999999834 | -1.556 | -1.485 | -1.336 |
| 4.849999999999834 | -1.557 | -1.486 | -1.338 |
| 4.854999999999834 | -1.558 | -1.487 | -1.34 |
| 4.859999999999834 | -1.559 | -1.488 | -1.341 |
| 4.864999999999834 | -1.56 | -1.49 | -1.343 |
| 4.869999999999834 | -1.562 | -1.491 | -1.344 |
| 4.874999999999834 | -1.563 | -1.492 | -1.346 |
| 4.879999999999833 | -1.564 | -1.493 | -1.348 |
| 4.884999999999834 | -1.565 | -1.494 | -1.349 |
| 4.889999999999833 | -1.566 | -1.496 | -1.351 |
| 4.894999999999833 | -1.567 | -1.497 | -1.353 |
| 4.899999999999833 | -1.568 | -1.498 | -1.354 |
| 4.904999999999833 | -1.569 | -1.499 | -1.356 |
| 4.909999999999833 | -1.57 | -1.501 | -1.358 |
| 4.914999999999833 | -1.571 | -1.502 | -1.359 |
| 4.919999999999832 | -1.572 | -1.503 | -1.361 |
| 4.924999999999833 | -1.573 | -1.504 | -1.362 |
| 4.929999999999832 | -1.574 | -1.505 | -1.364 |
| 4.934999999999832 | -1.575 | -1.507 | -1.366 |
| 4.939999999999832 | -1.576 | -1.508 | -1.367 |
| 4.944999999999832 | -1.577 | -1.509 | -1.369 |
| 4.949999999999832 | -1.579 | -1.51 | -1.371 |
| 4.954999999999832 | -1.58 | -1.511 | -1.372 |
| 4.959999999999832 | -1.581 | -1.513 | -1.374 |
| 4.964999999999832 | -1.582 | -1.514 | -1.375 |
| 4.969999999999831 | -1.583 | -1.515 | -1.377 |
| 4.974999999999831 | -1.584 | -1.516 | -1.378 |
| 4.97999999999983 | -1.585 | -1.517 | -1.38 |
| 4.984999999999831 | -1.586 | -1.519 | -1.382 |
| 4.98999999999983 | -1.587 | -1.52 | -1.383 |
| 4.994999999999831 | -1.588 | -1.521 | -1.385 |
| 4.99999999999983 | -1.589 | -1.522 | -1.386 |